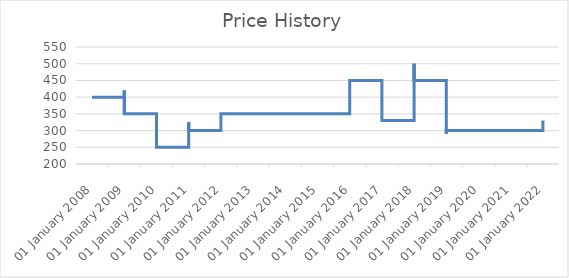
| Category | Series 0 |
|---|---|
| 2008-05-12 | 400 |
| 2008-05-13 | 400 |
| 2008-05-14 | 400 |
| 2008-05-15 | 400 |
| 2008-05-16 | 400 |
| 2008-05-19 | 400 |
| 2008-05-20 | 400 |
| 2008-05-21 | 400 |
| 2008-05-22 | 400 |
| 2008-05-23 | 400 |
| 2008-05-26 | 400 |
| 2008-05-27 | 400 |
| 2008-05-28 | 400 |
| 2008-05-29 | 400 |
| 2008-05-30 | 400 |
| 2008-06-02 | 400 |
| 2008-06-03 | 400 |
| 2008-06-04 | 400 |
| 2008-06-05 | 400 |
| 2008-06-06 | 400 |
| 2008-06-09 | 400 |
| 2008-06-10 | 400 |
| 2008-06-11 | 400 |
| 2008-06-12 | 400 |
| 2008-06-13 | 400 |
| 2008-06-16 | 400 |
| 2008-06-17 | 400 |
| 2008-06-18 | 400 |
| 2008-06-19 | 400 |
| 2008-06-20 | 400 |
| 2008-06-23 | 400 |
| 2008-06-24 | 400 |
| 2008-06-25 | 400 |
| 2008-06-26 | 400 |
| 2008-06-27 | 400 |
| 2008-06-30 | 400 |
| 2008-07-01 | 400 |
| 2008-07-02 | 400 |
| 2008-07-03 | 400 |
| 2008-07-04 | 400 |
| 2008-07-07 | 400 |
| 2008-07-08 | 400 |
| 2008-07-09 | 400 |
| 2008-07-10 | 400 |
| 2008-07-11 | 400 |
| 2008-07-14 | 400 |
| 2008-07-15 | 400 |
| 2008-07-16 | 400 |
| 2008-07-17 | 400 |
| 2008-07-18 | 400 |
| 2008-07-21 | 400 |
| 2008-07-22 | 400 |
| 2008-07-23 | 400 |
| 2008-07-24 | 400 |
| 2008-07-25 | 400 |
| 2008-07-28 | 400 |
| 2008-07-29 | 400 |
| 2008-07-30 | 400 |
| 2008-07-31 | 400 |
| 2008-08-01 | 400 |
| 2008-08-04 | 400 |
| 2008-08-05 | 400 |
| 2008-08-06 | 400 |
| 2008-08-07 | 400 |
| 2008-08-08 | 400 |
| 2008-08-11 | 400 |
| 2008-08-12 | 400 |
| 2008-08-13 | 400 |
| 2008-08-14 | 400 |
| 2008-08-15 | 400 |
| 2008-08-18 | 400 |
| 2008-08-19 | 400 |
| 2008-08-20 | 400 |
| 2008-08-21 | 400 |
| 2008-08-22 | 400 |
| 2008-08-25 | 400 |
| 2008-08-26 | 400 |
| 2008-08-27 | 400 |
| 2008-08-28 | 400 |
| 2008-08-29 | 400 |
| 2008-09-01 | 400 |
| 2008-09-02 | 400 |
| 2008-09-03 | 400 |
| 2008-09-04 | 400 |
| 2008-09-05 | 400 |
| 2008-09-08 | 400 |
| 2008-09-09 | 400 |
| 2008-09-10 | 400 |
| 2008-09-11 | 400 |
| 2008-09-12 | 400 |
| 2008-09-15 | 400 |
| 2008-09-16 | 400 |
| 2008-09-17 | 400 |
| 2008-09-18 | 400 |
| 2008-09-19 | 400 |
| 2008-09-22 | 400 |
| 2008-09-23 | 400 |
| 2008-09-24 | 400 |
| 2008-09-25 | 400 |
| 2008-09-26 | 400 |
| 2008-09-29 | 400 |
| 2008-09-30 | 400 |
| 2008-10-01 | 400 |
| 2008-10-02 | 400 |
| 2008-10-03 | 400 |
| 2008-10-06 | 400 |
| 2008-10-07 | 400 |
| 2008-10-08 | 400 |
| 2008-10-09 | 400 |
| 2008-10-10 | 400 |
| 2008-10-13 | 400 |
| 2008-10-14 | 400 |
| 2008-10-15 | 400 |
| 2008-10-16 | 400 |
| 2008-10-17 | 400 |
| 2008-10-20 | 400 |
| 2008-10-21 | 400 |
| 2008-10-22 | 400 |
| 2008-10-23 | 400 |
| 2008-10-24 | 400 |
| 2008-10-27 | 400 |
| 2008-10-28 | 400 |
| 2008-10-29 | 400 |
| 2008-10-30 | 400 |
| 2008-10-31 | 400 |
| 2008-11-03 | 400 |
| 2008-11-04 | 400 |
| 2008-11-05 | 400 |
| 2008-11-06 | 400 |
| 2008-11-07 | 400 |
| 2008-11-10 | 400 |
| 2008-11-11 | 400 |
| 2008-11-12 | 400 |
| 2008-11-13 | 400 |
| 2008-11-14 | 400 |
| 2008-11-17 | 400 |
| 2008-11-18 | 400 |
| 2008-11-19 | 400 |
| 2008-11-20 | 400 |
| 2008-11-21 | 400 |
| 2008-11-24 | 400 |
| 2008-11-25 | 400 |
| 2008-11-26 | 400 |
| 2008-11-27 | 400 |
| 2008-11-28 | 400 |
| 2008-12-01 | 400 |
| 2008-12-02 | 400 |
| 2008-12-03 | 400 |
| 2008-12-04 | 400 |
| 2008-12-05 | 400 |
| 2008-12-08 | 400 |
| 2008-12-09 | 400 |
| 2008-12-10 | 400 |
| 2008-12-11 | 400 |
| 2008-12-12 | 400 |
| 2008-12-15 | 400 |
| 2008-12-16 | 400 |
| 2008-12-17 | 400 |
| 2008-12-18 | 400 |
| 2008-12-19 | 400 |
| 2008-12-22 | 400 |
| 2008-12-23 | 400 |
| 2008-12-24 | 400 |
| 2008-12-25 | 400 |
| 2008-12-26 | 400 |
| 2008-12-29 | 400 |
| 2008-12-30 | 400 |
| 2008-12-31 | 400 |
| 2009-01-01 | 400 |
| 2009-01-02 | 400 |
| 2009-01-05 | 400 |
| 2009-01-06 | 400 |
| 2009-01-07 | 400 |
| 2009-01-08 | 400 |
| 2009-01-09 | 400 |
| 2009-01-12 | 400 |
| 2009-01-13 | 400 |
| 2009-01-14 | 400 |
| 2009-01-15 | 400 |
| 2009-01-16 | 400 |
| 2009-01-19 | 400 |
| 2009-01-20 | 400 |
| 2009-01-21 | 400 |
| 2009-01-22 | 400 |
| 2009-01-23 | 400 |
| 2009-01-26 | 400 |
| 2009-01-27 | 400 |
| 2009-01-28 | 400 |
| 2009-01-29 | 400 |
| 2009-01-30 | 400 |
| 2009-02-02 | 400 |
| 2009-02-03 | 400 |
| 2009-02-04 | 400 |
| 2009-02-05 | 400 |
| 2009-02-06 | 400 |
| 2009-02-09 | 400 |
| 2009-02-10 | 400 |
| 2009-02-11 | 400 |
| 2009-02-12 | 400 |
| 2009-02-13 | 400 |
| 2009-02-16 | 400 |
| 2009-02-17 | 400 |
| 2009-02-18 | 400 |
| 2009-02-19 | 400 |
| 2009-02-20 | 400 |
| 2009-02-23 | 400 |
| 2009-02-24 | 400 |
| 2009-02-25 | 400 |
| 2009-02-26 | 400 |
| 2009-02-27 | 400 |
| 2009-03-02 | 400 |
| 2009-03-03 | 400 |
| 2009-03-04 | 420 |
| 2009-03-05 | 420 |
| 2009-03-06 | 420 |
| 2009-03-09 | 420 |
| 2009-03-10 | 420 |
| 2009-03-11 | 420 |
| 2009-03-12 | 420 |
| 2009-03-13 | 420 |
| 2009-03-16 | 420 |
| 2009-03-17 | 420 |
| 2009-03-18 | 420 |
| 2009-03-19 | 420 |
| 2009-03-20 | 420 |
| 2009-03-23 | 420 |
| 2009-03-24 | 420 |
| 2009-03-25 | 420 |
| 2009-03-26 | 420 |
| 2009-03-27 | 420 |
| 2009-03-30 | 420 |
| 2009-03-31 | 420 |
| 2009-04-01 | 420 |
| 2009-04-02 | 420 |
| 2009-04-03 | 420 |
| 2009-04-06 | 420 |
| 2009-04-07 | 420 |
| 2009-04-08 | 420 |
| 2009-04-09 | 420 |
| 2009-04-10 | 420 |
| 2009-04-13 | 420 |
| 2009-04-14 | 420 |
| 2009-04-15 | 420 |
| 2009-04-16 | 420 |
| 2009-04-20 | 420 |
| 2009-04-21 | 420 |
| 2009-04-22 | 420 |
| 2009-04-23 | 420 |
| 2009-04-24 | 420 |
| 2009-04-27 | 420 |
| 2009-04-28 | 420 |
| 2009-04-29 | 420 |
| 2009-04-30 | 420 |
| 2009-05-01 | 420 |
| 2009-05-04 | 420 |
| 2009-05-05 | 420 |
| 2009-05-06 | 420 |
| 2009-05-07 | 420 |
| 2009-05-08 | 420 |
| 2009-05-11 | 420 |
| 2009-05-12 | 420 |
| 2009-05-13 | 420 |
| 2009-05-14 | 420 |
| 2009-05-15 | 420 |
| 2009-05-18 | 420 |
| 2009-05-19 | 420 |
| 2009-05-20 | 420 |
| 2009-05-21 | 420 |
| 2009-05-22 | 420 |
| 2009-05-25 | 420 |
| 2009-05-26 | 420 |
| 2009-05-27 | 420 |
| 2009-05-28 | 420 |
| 2009-05-29 | 420 |
| 2009-06-01 | 420 |
| 2009-06-02 | 420 |
| 2009-06-03 | 420 |
| 2009-06-04 | 420 |
| 2009-06-05 | 420 |
| 2009-06-08 | 420 |
| 2009-06-09 | 420 |
| 2009-06-10 | 420 |
| 2009-06-11 | 420 |
| 2009-06-12 | 420 |
| 2009-06-15 | 420 |
| 2009-06-16 | 420 |
| 2009-06-17 | 420 |
| 2009-06-18 | 420 |
| 2009-06-19 | 420 |
| 2009-06-22 | 420 |
| 2009-06-23 | 420 |
| 2009-06-24 | 420 |
| 2009-06-25 | 420 |
| 2009-06-26 | 420 |
| 2009-06-29 | 420 |
| 2009-06-30 | 420 |
| 2009-07-01 | 420 |
| 2009-07-02 | 420 |
| 2009-07-03 | 420 |
| 2009-07-06 | 420 |
| 2009-07-07 | 350 |
| 2009-07-08 | 350 |
| 2009-07-09 | 350 |
| 2009-07-10 | 350 |
| 2009-07-13 | 350 |
| 2009-07-14 | 350 |
| 2009-07-15 | 350 |
| 2009-07-16 | 350 |
| 2009-07-17 | 350 |
| 2009-07-20 | 350 |
| 2009-07-21 | 350 |
| 2009-07-22 | 350 |
| 2009-07-23 | 350 |
| 2009-07-24 | 350 |
| 2009-07-27 | 350 |
| 2009-07-28 | 350 |
| 2009-07-29 | 350 |
| 2009-07-30 | 350 |
| 2009-07-31 | 350 |
| 2009-08-03 | 350 |
| 2009-08-04 | 350 |
| 2009-08-05 | 350 |
| 2009-08-06 | 350 |
| 2009-08-07 | 350 |
| 2009-08-10 | 350 |
| 2009-08-11 | 350 |
| 2009-08-12 | 350 |
| 2009-08-13 | 350 |
| 2009-08-14 | 350 |
| 2009-08-17 | 350 |
| 2009-08-18 | 350 |
| 2009-08-19 | 350 |
| 2009-08-20 | 350 |
| 2009-08-21 | 350 |
| 2009-08-24 | 350 |
| 2009-08-25 | 350 |
| 2009-08-26 | 350 |
| 2009-08-27 | 350 |
| 2009-08-28 | 350 |
| 2009-08-31 | 350 |
| 2009-09-01 | 350 |
| 2009-09-02 | 350 |
| 2009-09-03 | 350 |
| 2009-09-04 | 350 |
| 2009-09-07 | 350 |
| 2009-09-08 | 350 |
| 2009-09-09 | 350 |
| 2009-09-10 | 350 |
| 2009-09-11 | 350 |
| 2009-09-14 | 350 |
| 2009-09-15 | 350 |
| 2009-09-16 | 350 |
| 2009-09-17 | 350 |
| 2009-09-18 | 350 |
| 2009-09-21 | 350 |
| 2009-09-22 | 350 |
| 2009-09-23 | 350 |
| 2009-09-24 | 350 |
| 2009-09-25 | 350 |
| 2009-09-28 | 350 |
| 2009-09-29 | 350 |
| 2009-09-30 | 350 |
| 2009-10-01 | 350 |
| 2009-10-02 | 350 |
| 2009-10-05 | 350 |
| 2009-10-06 | 350 |
| 2009-10-07 | 350 |
| 2009-10-08 | 350 |
| 2009-10-09 | 350 |
| 2009-10-12 | 350 |
| 2009-10-13 | 350 |
| 2009-10-14 | 350 |
| 2009-10-15 | 350 |
| 2009-10-16 | 350 |
| 2009-10-20 | 350 |
| 2009-10-21 | 350 |
| 2009-10-22 | 350 |
| 2009-10-23 | 350 |
| 2009-10-26 | 350 |
| 2009-10-27 | 350 |
| 2009-10-28 | 350 |
| 2009-10-29 | 350 |
| 2009-10-30 | 350 |
| 2009-11-02 | 350 |
| 2009-11-03 | 350 |
| 2009-11-04 | 350 |
| 2009-11-05 | 350 |
| 2009-11-06 | 350 |
| 2009-11-09 | 350 |
| 2009-11-10 | 350 |
| 2009-11-11 | 350 |
| 2009-11-12 | 350 |
| 2009-11-13 | 350 |
| 2009-11-16 | 350 |
| 2009-11-17 | 350 |
| 2009-11-19 | 350 |
| 2009-11-20 | 350 |
| 2009-11-23 | 350 |
| 2009-11-24 | 350 |
| 2009-11-25 | 350 |
| 2009-11-26 | 350 |
| 2009-11-27 | 350 |
| 2009-11-30 | 350 |
| 2009-12-01 | 350 |
| 2009-12-02 | 350 |
| 2009-12-03 | 350 |
| 2009-12-04 | 350 |
| 2009-12-07 | 350 |
| 2009-12-08 | 350 |
| 2009-12-09 | 350 |
| 2009-12-10 | 350 |
| 2009-12-11 | 350 |
| 2009-12-14 | 350 |
| 2009-12-15 | 350 |
| 2009-12-16 | 350 |
| 2009-12-17 | 350 |
| 2009-12-18 | 350 |
| 2009-12-21 | 350 |
| 2009-12-22 | 350 |
| 2009-12-23 | 350 |
| 2009-12-24 | 350 |
| 2009-12-25 | 350 |
| 2009-12-28 | 350 |
| 2009-12-29 | 350 |
| 2009-12-30 | 350 |
| 2009-12-31 | 350 |
| 2010-01-01 | 350 |
| 2010-01-04 | 350 |
| 2010-01-05 | 350 |
| 2010-01-06 | 350 |
| 2010-01-07 | 350 |
| 2010-01-08 | 350 |
| 2010-01-11 | 350 |
| 2010-01-12 | 350 |
| 2010-01-13 | 350 |
| 2010-01-14 | 350 |
| 2010-01-15 | 350 |
| 2010-01-18 | 350 |
| 2010-01-19 | 350 |
| 2010-01-20 | 350 |
| 2010-01-21 | 350 |
| 2010-01-22 | 350 |
| 2010-01-25 | 350 |
| 2010-01-26 | 350 |
| 2010-01-27 | 350 |
| 2010-01-28 | 350 |
| 2010-01-29 | 350 |
| 2010-02-01 | 350 |
| 2010-02-02 | 350 |
| 2010-02-03 | 350 |
| 2010-02-04 | 350 |
| 2010-02-05 | 350 |
| 2010-02-08 | 350 |
| 2010-02-09 | 350 |
| 2010-02-10 | 350 |
| 2010-02-11 | 350 |
| 2010-02-12 | 350 |
| 2010-02-15 | 350 |
| 2010-02-16 | 350 |
| 2010-02-17 | 350 |
| 2010-02-18 | 350 |
| 2010-02-19 | 350 |
| 2010-02-22 | 350 |
| 2010-02-23 | 350 |
| 2010-02-24 | 350 |
| 2010-02-25 | 350 |
| 2010-02-26 | 350 |
| 2010-03-01 | 350 |
| 2010-03-02 | 350 |
| 2010-03-03 | 350 |
| 2010-03-04 | 350 |
| 2010-03-05 | 350 |
| 2010-03-08 | 350 |
| 2010-03-09 | 350 |
| 2010-03-10 | 350 |
| 2010-03-11 | 350 |
| 2010-03-12 | 350 |
| 2010-03-15 | 350 |
| 2010-03-16 | 350 |
| 2010-03-17 | 350 |
| 2010-03-18 | 350 |
| 2010-03-19 | 350 |
| 2010-03-22 | 350 |
| 2010-03-23 | 350 |
| 2010-03-24 | 350 |
| 2010-03-25 | 350 |
| 2010-03-26 | 350 |
| 2010-03-29 | 350 |
| 2010-03-30 | 350 |
| 2010-03-31 | 350 |
| 2010-04-01 | 350 |
| 2010-04-02 | 350 |
| 2010-04-05 | 350 |
| 2010-04-06 | 350 |
| 2010-04-07 | 350 |
| 2010-04-08 | 350 |
| 2010-04-09 | 350 |
| 2010-04-12 | 350 |
| 2010-04-13 | 350 |
| 2010-04-14 | 350 |
| 2010-04-15 | 350 |
| 2010-04-16 | 350 |
| 2010-04-19 | 350 |
| 2010-04-20 | 350 |
| 2010-04-21 | 350 |
| 2010-04-22 | 350 |
| 2010-04-23 | 350 |
| 2010-04-26 | 350 |
| 2010-04-27 | 350 |
| 2010-04-28 | 350 |
| 2010-04-29 | 350 |
| 2010-04-30 | 350 |
| 2010-05-03 | 350 |
| 2010-05-04 | 350 |
| 2010-05-05 | 350 |
| 2010-05-06 | 350 |
| 2010-05-07 | 350 |
| 2010-05-10 | 350 |
| 2010-05-11 | 350 |
| 2010-05-12 | 350 |
| 2010-05-13 | 350 |
| 2010-05-14 | 350 |
| 2010-05-17 | 350 |
| 2010-05-18 | 350 |
| 2010-05-19 | 350 |
| 2010-05-20 | 350 |
| 2010-05-21 | 350 |
| 2010-05-24 | 350 |
| 2010-05-25 | 350 |
| 2010-05-26 | 350 |
| 2010-05-27 | 350 |
| 2010-05-28 | 350 |
| 2010-05-31 | 350 |
| 2010-06-01 | 350 |
| 2010-06-02 | 350 |
| 2010-06-03 | 350 |
| 2010-06-04 | 350 |
| 2010-06-07 | 350 |
| 2010-06-08 | 350 |
| 2010-06-09 | 350 |
| 2010-06-10 | 350 |
| 2010-06-11 | 250 |
| 2010-06-14 | 250 |
| 2010-06-15 | 250 |
| 2010-06-16 | 250 |
| 2010-06-17 | 250 |
| 2010-06-18 | 250 |
| 2010-06-21 | 250 |
| 2010-06-22 | 250 |
| 2010-06-23 | 250 |
| 2010-06-24 | 250 |
| 2010-06-25 | 250 |
| 2010-06-28 | 250 |
| 2010-06-29 | 250 |
| 2010-06-30 | 250 |
| 2010-07-01 | 250 |
| 2010-07-02 | 250 |
| 2010-07-05 | 250 |
| 2010-07-06 | 250 |
| 2010-07-07 | 250 |
| 2010-07-08 | 250 |
| 2010-07-09 | 250 |
| 2010-07-12 | 250 |
| 2010-07-13 | 250 |
| 2010-07-14 | 250 |
| 2010-07-15 | 250 |
| 2010-07-16 | 250 |
| 2010-07-19 | 250 |
| 2010-07-20 | 250 |
| 2010-07-21 | 250 |
| 2010-07-22 | 250 |
| 2010-07-23 | 250 |
| 2010-07-26 | 250 |
| 2010-07-27 | 250 |
| 2010-07-28 | 250 |
| 2010-07-29 | 250 |
| 2010-07-30 | 250 |
| 2010-08-02 | 250 |
| 2010-08-03 | 250 |
| 2010-08-04 | 250 |
| 2010-08-05 | 250 |
| 2010-08-06 | 250 |
| 2010-08-09 | 250 |
| 2010-08-10 | 250 |
| 2010-08-11 | 250 |
| 2010-08-12 | 250 |
| 2010-08-13 | 250 |
| 2010-08-16 | 250 |
| 2010-08-17 | 250 |
| 2010-08-18 | 250 |
| 2010-08-19 | 250 |
| 2010-08-20 | 250 |
| 2010-08-23 | 250 |
| 2010-08-24 | 250 |
| 2010-08-25 | 250 |
| 2010-08-26 | 250 |
| 2010-08-27 | 250 |
| 2010-08-30 | 250 |
| 2010-08-31 | 250 |
| 2010-09-01 | 250 |
| 2010-09-02 | 250 |
| 2010-09-03 | 250 |
| 2010-09-06 | 250 |
| 2010-09-07 | 250 |
| 2010-09-08 | 250 |
| 2010-09-09 | 250 |
| 2010-09-10 | 250 |
| 2010-09-13 | 250 |
| 2010-09-14 | 250 |
| 2010-09-15 | 250 |
| 2010-09-16 | 250 |
| 2010-09-17 | 250 |
| 2010-09-20 | 250 |
| 2010-09-21 | 250 |
| 2010-09-22 | 250 |
| 2010-09-23 | 250 |
| 2010-09-24 | 250 |
| 2010-09-27 | 250 |
| 2010-09-28 | 250 |
| 2010-09-29 | 250 |
| 2010-09-30 | 250 |
| 2010-10-01 | 250 |
| 2010-10-04 | 250 |
| 2010-10-05 | 250 |
| 2010-10-06 | 250 |
| 2010-10-07 | 250 |
| 2010-10-08 | 250 |
| 2010-10-11 | 250 |
| 2010-10-12 | 250 |
| 2010-10-13 | 250 |
| 2010-10-14 | 250 |
| 2010-10-15 | 250 |
| 2010-10-18 | 250 |
| 2010-10-19 | 250 |
| 2010-10-20 | 250 |
| 2010-10-21 | 250 |
| 2010-10-22 | 250 |
| 2010-10-25 | 250 |
| 2010-10-26 | 250 |
| 2010-10-27 | 250 |
| 2010-10-28 | 250 |
| 2010-10-29 | 250 |
| 2010-11-01 | 250 |
| 2010-11-02 | 250 |
| 2010-11-03 | 250 |
| 2010-11-04 | 250 |
| 2010-11-05 | 250 |
| 2010-11-08 | 250 |
| 2010-11-09 | 250 |
| 2010-11-10 | 250 |
| 2010-11-11 | 250 |
| 2010-11-12 | 250 |
| 2010-11-15 | 250 |
| 2010-11-16 | 250 |
| 2010-11-17 | 250 |
| 2010-11-18 | 250 |
| 2010-11-19 | 250 |
| 2010-11-22 | 250 |
| 2010-11-23 | 250 |
| 2010-11-24 | 250 |
| 2010-11-25 | 250 |
| 2010-11-26 | 250 |
| 2010-11-29 | 250 |
| 2010-11-30 | 250 |
| 2010-12-01 | 250 |
| 2010-12-02 | 250 |
| 2010-12-03 | 250 |
| 2010-12-06 | 250 |
| 2010-12-07 | 250 |
| 2010-12-08 | 250 |
| 2010-12-09 | 250 |
| 2010-12-10 | 250 |
| 2010-12-13 | 250 |
| 2010-12-14 | 250 |
| 2010-12-15 | 250 |
| 2010-12-16 | 250 |
| 2010-12-17 | 250 |
| 2010-12-20 | 250 |
| 2010-12-21 | 250 |
| 2010-12-22 | 250 |
| 2010-12-23 | 250 |
| 2010-12-24 | 250 |
| 2010-12-27 | 250 |
| 2010-12-28 | 250 |
| 2010-12-29 | 250 |
| 2010-12-30 | 250 |
| 2010-12-31 | 250 |
| 2011-01-03 | 250 |
| 2011-01-04 | 250 |
| 2011-01-05 | 325 |
| 2011-01-06 | 325 |
| 2011-01-07 | 325 |
| 2011-01-10 | 325 |
| 2011-01-11 | 325 |
| 2011-01-12 | 325 |
| 2011-01-13 | 325 |
| 2011-01-14 | 325 |
| 2011-01-17 | 325 |
| 2011-01-18 | 325 |
| 2011-01-19 | 325 |
| 2011-01-20 | 325 |
| 2011-01-21 | 325 |
| 2011-01-24 | 325 |
| 2011-01-25 | 325 |
| 2011-01-26 | 325 |
| 2011-01-27 | 325 |
| 2011-01-28 | 325 |
| 2011-01-31 | 325 |
| 2011-02-01 | 325 |
| 2011-02-02 | 325 |
| 2011-02-03 | 325 |
| 2011-02-04 | 325 |
| 2011-02-07 | 325 |
| 2011-02-08 | 325 |
| 2011-02-09 | 325 |
| 2011-02-16 | 325 |
| 2011-02-17 | 325 |
| 2011-02-18 | 325 |
| 2011-02-21 | 325 |
| 2011-02-22 | 325 |
| 2011-02-23 | 325 |
| 2011-02-24 | 325 |
| 2011-02-25 | 325 |
| 2011-02-28 | 325 |
| 2011-03-01 | 325 |
| 2011-03-02 | 325 |
| 2011-03-03 | 325 |
| 2011-03-04 | 325 |
| 2011-03-07 | 325 |
| 2011-03-08 | 325 |
| 2011-03-09 | 325 |
| 2011-03-10 | 325 |
| 2011-03-11 | 325 |
| 2011-03-14 | 325 |
| 2011-03-15 | 325 |
| 2011-03-16 | 325 |
| 2011-03-17 | 325 |
| 2011-03-18 | 325 |
| 2011-03-21 | 325 |
| 2011-03-22 | 325 |
| 2011-03-23 | 325 |
| 2011-03-24 | 325 |
| 2011-03-25 | 325 |
| 2011-03-28 | 325 |
| 2011-03-29 | 325 |
| 2011-03-30 | 325 |
| 2011-03-31 | 325 |
| 2011-04-01 | 325 |
| 2011-04-04 | 325 |
| 2011-04-05 | 325 |
| 2011-04-06 | 325 |
| 2011-04-07 | 325 |
| 2011-04-08 | 325 |
| 2011-04-11 | 325 |
| 2011-04-12 | 325 |
| 2011-04-13 | 325 |
| 2011-04-14 | 325 |
| 2011-04-15 | 325 |
| 2011-04-18 | 325 |
| 2011-04-19 | 325 |
| 2011-04-20 | 325 |
| 2011-04-21 | 325 |
| 2011-04-22 | 325 |
| 2011-04-25 | 325 |
| 2011-04-26 | 325 |
| 2011-04-27 | 325 |
| 2011-04-28 | 325 |
| 2011-04-29 | 325 |
| 2011-05-02 | 325 |
| 2011-05-03 | 325 |
| 2011-05-04 | 325 |
| 2011-05-05 | 325 |
| 2011-05-06 | 325 |
| 2011-05-09 | 325 |
| 2011-05-10 | 325 |
| 2011-05-11 | 325 |
| 2011-05-12 | 325 |
| 2011-05-13 | 325 |
| 2011-05-23 | 325 |
| 2011-05-24 | 325 |
| 2011-05-25 | 325 |
| 2011-05-26 | 325 |
| 2011-05-27 | 325 |
| 2011-05-30 | 325 |
| 2011-05-31 | 325 |
| 2011-06-01 | 325 |
| 2011-06-02 | 325 |
| 2011-06-03 | 325 |
| 2011-06-06 | 325 |
| 2011-06-07 | 325 |
| 2011-06-08 | 325 |
| 2011-06-09 | 325 |
| 2011-06-10 | 325 |
| 2011-06-13 | 325 |
| 2011-06-14 | 325 |
| 2011-06-15 | 325 |
| 2011-06-16 | 325 |
| 2011-06-17 | 325 |
| 2011-06-20 | 325 |
| 2011-06-21 | 325 |
| 2011-06-22 | 325 |
| 2011-06-23 | 325 |
| 2011-06-24 | 325 |
| 2011-06-27 | 325 |
| 2011-06-28 | 325 |
| 2011-06-29 | 325 |
| 2011-06-30 | 300 |
| 2011-07-01 | 300 |
| 2011-07-04 | 300 |
| 2011-07-05 | 300 |
| 2011-07-06 | 300 |
| 2011-07-07 | 300 |
| 2011-07-08 | 300 |
| 2011-07-11 | 300 |
| 2011-07-12 | 300 |
| 2011-07-13 | 300 |
| 2011-07-14 | 300 |
| 2011-07-15 | 300 |
| 2011-07-18 | 300 |
| 2011-07-19 | 300 |
| 2011-07-20 | 300 |
| 2011-07-21 | 300 |
| 2011-07-22 | 300 |
| 2011-07-25 | 300 |
| 2011-07-26 | 300 |
| 2011-07-27 | 300 |
| 2011-07-28 | 300 |
| 2011-07-29 | 300 |
| 2011-08-01 | 300 |
| 2011-08-02 | 300 |
| 2011-08-03 | 300 |
| 2011-08-04 | 300 |
| 2011-08-05 | 300 |
| 2011-08-08 | 300 |
| 2011-08-09 | 300 |
| 2011-08-10 | 300 |
| 2011-08-11 | 300 |
| 2011-08-12 | 300 |
| 2011-08-15 | 300 |
| 2011-08-16 | 300 |
| 2011-08-17 | 300 |
| 2011-08-18 | 300 |
| 2011-08-19 | 300 |
| 2011-08-22 | 300 |
| 2011-08-23 | 300 |
| 2011-08-24 | 300 |
| 2011-08-25 | 300 |
| 2011-08-26 | 300 |
| 2011-08-29 | 300 |
| 2011-08-30 | 300 |
| 2011-08-31 | 300 |
| 2011-09-01 | 300 |
| 2011-09-02 | 300 |
| 2011-09-05 | 300 |
| 2011-09-06 | 300 |
| 2011-09-07 | 300 |
| 2011-09-08 | 300 |
| 2011-09-09 | 300 |
| 2011-09-12 | 300 |
| 2011-09-13 | 300 |
| 2011-09-14 | 300 |
| 2011-09-15 | 300 |
| 2011-09-16 | 300 |
| 2011-09-26 | 300 |
| 2011-09-27 | 300 |
| 2011-09-28 | 300 |
| 2011-09-29 | 300 |
| 2011-09-30 | 300 |
| 2011-10-03 | 300 |
| 2011-10-04 | 300 |
| 2011-10-05 | 300 |
| 2011-10-06 | 300 |
| 2011-10-07 | 300 |
| 2011-10-10 | 300 |
| 2011-10-11 | 300 |
| 2011-10-12 | 300 |
| 2011-10-13 | 300 |
| 2011-10-14 | 300 |
| 2011-10-17 | 300 |
| 2011-10-18 | 300 |
| 2011-10-19 | 300 |
| 2011-10-20 | 300 |
| 2011-10-21 | 300 |
| 2011-10-24 | 300 |
| 2011-10-25 | 300 |
| 2011-10-26 | 300 |
| 2011-10-27 | 300 |
| 2011-10-28 | 300 |
| 2011-10-31 | 300 |
| 2011-11-01 | 300 |
| 2011-11-02 | 300 |
| 2011-11-03 | 300 |
| 2011-11-04 | 300 |
| 2011-11-07 | 300 |
| 2011-11-08 | 300 |
| 2011-11-09 | 300 |
| 2011-11-10 | 300 |
| 2011-11-11 | 300 |
| 2011-11-14 | 300 |
| 2011-11-15 | 300 |
| 2011-11-16 | 300 |
| 2011-11-17 | 300 |
| 2011-11-18 | 300 |
| 2011-11-21 | 300 |
| 2011-11-22 | 300 |
| 2011-11-23 | 300 |
| 2011-11-24 | 300 |
| 2011-11-25 | 300 |
| 2011-11-28 | 300 |
| 2011-11-29 | 300 |
| 2011-11-30 | 300 |
| 2011-12-01 | 300 |
| 2011-12-02 | 300 |
| 2011-12-05 | 300 |
| 2011-12-06 | 300 |
| 2011-12-07 | 300 |
| 2011-12-08 | 300 |
| 2011-12-09 | 300 |
| 2011-12-12 | 300 |
| 2011-12-13 | 300 |
| 2011-12-14 | 300 |
| 2011-12-15 | 300 |
| 2011-12-16 | 300 |
| 2011-12-19 | 300 |
| 2011-12-20 | 300 |
| 2011-12-21 | 300 |
| 2011-12-22 | 300 |
| 2011-12-23 | 300 |
| 2011-12-26 | 300 |
| 2011-12-27 | 300 |
| 2011-12-28 | 300 |
| 2011-12-29 | 300 |
| 2011-12-30 | 300 |
| 2012-01-02 | 300 |
| 2012-01-03 | 300 |
| 2012-01-04 | 300 |
| 2012-01-05 | 300 |
| 2012-01-06 | 300 |
| 2012-01-09 | 300 |
| 2012-01-10 | 300 |
| 2012-01-11 | 300 |
| 2012-01-12 | 300 |
| 2012-01-13 | 300 |
| 2012-01-16 | 300 |
| 2012-01-17 | 300 |
| 2012-01-18 | 300 |
| 2012-01-19 | 300 |
| 2012-01-20 | 300 |
| 2012-01-23 | 300 |
| 2012-01-24 | 300 |
| 2012-01-25 | 300 |
| 2012-01-26 | 300 |
| 2012-01-27 | 300 |
| 2012-01-30 | 300 |
| 2012-01-31 | 300 |
| 2012-02-01 | 300 |
| 2012-02-02 | 300 |
| 2012-02-03 | 300 |
| 2012-02-06 | 300 |
| 2012-02-07 | 300 |
| 2012-02-08 | 300 |
| 2012-02-09 | 300 |
| 2012-02-10 | 300 |
| 2012-02-13 | 300 |
| 2012-02-14 | 300 |
| 2012-02-15 | 300 |
| 2012-02-16 | 300 |
| 2012-02-17 | 300 |
| 2012-02-20 | 300 |
| 2012-02-21 | 300 |
| 2012-02-22 | 300 |
| 2012-02-23 | 300 |
| 2012-02-24 | 300 |
| 2012-02-27 | 300 |
| 2012-02-28 | 300 |
| 2012-02-29 | 300 |
| 2012-03-01 | 300 |
| 2012-03-02 | 300 |
| 2012-03-05 | 300 |
| 2012-03-06 | 300 |
| 2012-03-07 | 300 |
| 2012-03-08 | 300 |
| 2012-03-09 | 300 |
| 2012-03-12 | 300 |
| 2012-03-13 | 300 |
| 2012-03-14 | 300 |
| 2012-03-15 | 300 |
| 2012-03-16 | 300 |
| 2012-03-19 | 300 |
| 2012-03-20 | 300 |
| 2012-03-21 | 300 |
| 2012-03-22 | 300 |
| 2012-03-23 | 300 |
| 2012-04-05 | 300 |
| 2012-04-06 | 300 |
| 2012-04-09 | 300 |
| 2012-04-10 | 300 |
| 2012-04-11 | 300 |
| 2012-04-12 | 300 |
| 2012-04-13 | 300 |
| 2012-04-16 | 300 |
| 2012-04-17 | 300 |
| 2012-04-18 | 300 |
| 2012-04-19 | 300 |
| 2012-04-20 | 300 |
| 2012-04-23 | 300 |
| 2012-04-24 | 300 |
| 2012-04-25 | 300 |
| 2012-04-26 | 300 |
| 2012-04-27 | 300 |
| 2012-04-30 | 300 |
| 2012-05-01 | 300 |
| 2012-05-02 | 300 |
| 2012-05-03 | 300 |
| 2012-05-04 | 300 |
| 2012-05-07 | 300 |
| 2012-05-08 | 300 |
| 2012-05-09 | 300 |
| 2012-05-10 | 300 |
| 2012-05-11 | 300 |
| 2012-05-14 | 300 |
| 2012-05-15 | 300 |
| 2012-05-16 | 300 |
| 2012-05-17 | 300 |
| 2012-05-18 | 300 |
| 2012-05-21 | 300 |
| 2012-05-22 | 300 |
| 2012-05-23 | 300 |
| 2012-05-24 | 300 |
| 2012-05-25 | 300 |
| 2012-05-28 | 300 |
| 2012-05-29 | 300 |
| 2012-05-30 | 300 |
| 2012-05-31 | 300 |
| 2012-06-01 | 300 |
| 2012-06-04 | 300 |
| 2012-06-05 | 300 |
| 2012-06-06 | 300 |
| 2012-06-07 | 300 |
| 2012-06-08 | 300 |
| 2012-06-11 | 300 |
| 2012-06-12 | 300 |
| 2012-06-13 | 300 |
| 2012-06-14 | 300 |
| 2012-06-15 | 300 |
| 2012-06-18 | 300 |
| 2012-06-19 | 300 |
| 2012-06-20 | 300 |
| 2012-06-21 | 300 |
| 2012-06-22 | 300 |
| 2012-06-25 | 300 |
| 2012-06-26 | 300 |
| 2012-06-27 | 300 |
| 2012-06-28 | 300 |
| 2012-06-29 | 300 |
| 2012-07-02 | 300 |
| 2012-07-03 | 300 |
| 2012-07-04 | 300 |
| 2012-07-05 | 300 |
| 2012-07-06 | 300 |
| 2012-07-09 | 300 |
| 2012-07-10 | 300 |
| 2012-07-11 | 300 |
| 2012-07-12 | 300 |
| 2012-07-13 | 300 |
| 2012-07-16 | 300 |
| 2012-07-17 | 300 |
| 2012-07-18 | 300 |
| 2012-07-19 | 300 |
| 2012-07-20 | 300 |
| 2012-07-23 | 300 |
| 2012-07-24 | 300 |
| 2012-07-25 | 300 |
| 2012-07-26 | 300 |
| 2012-07-27 | 300 |
| 2012-07-30 | 300 |
| 2012-07-31 | 300 |
| 2012-08-01 | 300 |
| 2012-08-02 | 300 |
| 2012-08-03 | 300 |
| 2012-08-06 | 300 |
| 2012-08-07 | 300 |
| 2012-08-08 | 300 |
| 2012-08-09 | 300 |
| 2012-08-10 | 300 |
| 2012-08-13 | 300 |
| 2012-08-14 | 300 |
| 2012-08-15 | 300 |
| 2012-08-16 | 300 |
| 2012-08-17 | 300 |
| 2012-08-20 | 300 |
| 2012-08-21 | 300 |
| 2012-08-22 | 300 |
| 2012-08-23 | 300 |
| 2012-08-24 | 300 |
| 2012-08-27 | 300 |
| 2012-08-28 | 300 |
| 2012-08-29 | 300 |
| 2012-08-30 | 300 |
| 2012-08-31 | 300 |
| 2012-09-03 | 300 |
| 2012-09-04 | 300 |
| 2012-09-05 | 300 |
| 2012-09-06 | 300 |
| 2012-09-07 | 300 |
| 2012-09-10 | 300 |
| 2012-09-11 | 300 |
| 2012-09-12 | 300 |
| 2012-09-13 | 300 |
| 2012-09-14 | 300 |
| 2012-09-17 | 300 |
| 2012-09-18 | 300 |
| 2012-09-19 | 300 |
| 2012-09-20 | 300 |
| 2012-09-21 | 300 |
| 2012-09-24 | 300 |
| 2012-09-25 | 300 |
| 2012-09-26 | 300 |
| 2012-09-27 | 300 |
| 2012-09-28 | 300 |
| 2012-10-01 | 300 |
| 2012-10-02 | 300 |
| 2012-10-03 | 300 |
| 2012-10-04 | 300 |
| 2012-10-05 | 300 |
| 2012-10-08 | 300 |
| 2012-10-09 | 300 |
| 2012-10-10 | 300 |
| 2012-10-11 | 300 |
| 2012-10-12 | 300 |
| 2012-10-15 | 300 |
| 2012-10-16 | 300 |
| 2012-10-17 | 300 |
| 2012-10-18 | 300 |
| 2012-10-19 | 300 |
| 2012-10-22 | 300 |
| 2012-10-23 | 300 |
| 2012-10-24 | 300 |
| 2012-10-25 | 300 |
| 2012-10-26 | 300 |
| 2012-10-29 | 300 |
| 2012-10-30 | 300 |
| 2012-10-31 | 300 |
| 2012-11-01 | 300 |
| 2012-11-02 | 300 |
| 2012-11-05 | 300 |
| 2012-11-06 | 300 |
| 2012-11-07 | 300 |
| 2012-11-08 | 300 |
| 2012-11-09 | 300 |
| 2012-11-12 | 300 |
| 2012-11-13 | 300 |
| 2012-11-14 | 300 |
| 2012-11-15 | 300 |
| 2012-11-16 | 300 |
| 2012-11-19 | 300 |
| 2012-11-20 | 300 |
| 2012-11-21 | 300 |
| 2012-11-22 | 300 |
| 2012-11-23 | 300 |
| 2012-11-26 | 300 |
| 2012-11-27 | 300 |
| 2012-11-28 | 300 |
| 2012-11-29 | 300 |
| 2012-11-30 | 300 |
| 2012-12-03 | 300 |
| 2012-12-04 | 300 |
| 2012-12-05 | 350 |
| 2012-12-06 | 350 |
| 2012-12-07 | 350 |
| 2012-12-10 | 350 |
| 2012-12-11 | 350 |
| 2012-12-12 | 350 |
| 2012-12-17 | 350 |
| 2012-12-18 | 350 |
| 2012-12-19 | 350 |
| 2012-12-20 | 350 |
| 2012-12-21 | 350 |
| 2012-12-25 | 350 |
| 2012-12-26 | 350 |
| 2012-12-27 | 350 |
| 2012-12-31 | 350 |
| 2013-01-01 | 350 |
| 2013-01-02 | 350 |
| 2013-01-03 | 350 |
| 2013-01-04 | 350 |
| 2013-01-07 | 350 |
| 2013-01-08 | 350 |
| 2013-01-09 | 350 |
| 2013-01-10 | 350 |
| 2013-01-11 | 350 |
| 2013-01-14 | 350 |
| 2013-01-15 | 350 |
| 2013-01-16 | 350 |
| 2013-01-17 | 350 |
| 2013-01-18 | 350 |
| 2013-01-21 | 350 |
| 2013-01-22 | 350 |
| 2013-01-23 | 350 |
| 2013-01-24 | 350 |
| 2013-01-28 | 350 |
| 2013-01-29 | 350 |
| 2013-01-30 | 350 |
| 2013-01-31 | 350 |
| 2013-02-11 | 350 |
| 2013-02-12 | 350 |
| 2013-02-13 | 350 |
| 2013-02-14 | 350 |
| 2013-02-15 | 350 |
| 2013-02-18 | 350 |
| 2013-02-19 | 350 |
| 2013-02-20 | 350 |
| 2013-02-21 | 350 |
| 2013-02-22 | 350 |
| 2013-02-25 | 350 |
| 2013-02-26 | 350 |
| 2013-02-27 | 350 |
| 2013-03-04 | 350 |
| 2013-03-05 | 350 |
| 2013-03-06 | 350 |
| 2013-03-07 | 350 |
| 2013-03-08 | 350 |
| 2013-03-11 | 350 |
| 2013-03-12 | 350 |
| 2013-03-13 | 350 |
| 2013-03-14 | 350 |
| 2013-03-15 | 350 |
| 2013-03-18 | 350 |
| 2013-03-19 | 350 |
| 2013-03-20 | 350 |
| 2013-03-21 | 350 |
| 2013-03-22 | 350 |
| 2013-03-25 | 350 |
| 2013-03-26 | 350 |
| 2013-03-27 | 350 |
| 2013-03-28 | 350 |
| 2013-03-29 | 350 |
| 2013-04-01 | 350 |
| 2013-04-02 | 350 |
| 2013-04-03 | 350 |
| 2013-04-04 | 350 |
| 2013-04-05 | 350 |
| 2013-04-09 | 350 |
| 2013-04-10 | 350 |
| 2013-04-11 | 350 |
| 2013-04-12 | 350 |
| 2013-04-15 | 350 |
| 2013-04-16 | 350 |
| 2013-04-17 | 350 |
| 2013-04-18 | 350 |
| 2013-04-19 | 350 |
| 2013-04-22 | 350 |
| 2013-04-23 | 350 |
| 2013-04-24 | 350 |
| 2013-04-25 | 350 |
| 2013-04-26 | 350 |
| 2013-04-29 | 350 |
| 2013-04-30 | 350 |
| 2013-05-01 | 350 |
| 2013-05-02 | 350 |
| 2013-05-03 | 350 |
| 2013-05-06 | 350 |
| 2013-05-07 | 350 |
| 2013-05-08 | 350 |
| 2013-05-09 | 350 |
| 2013-05-10 | 350 |
| 2013-05-13 | 350 |
| 2013-05-14 | 350 |
| 2013-05-15 | 350 |
| 2013-05-16 | 350 |
| 2013-05-17 | 350 |
| 2013-05-20 | 350 |
| 2013-05-21 | 350 |
| 2013-05-22 | 350 |
| 2013-05-23 | 350 |
| 2013-05-27 | 350 |
| 2013-05-28 | 350 |
| 2013-05-29 | 350 |
| 2013-05-30 | 350 |
| 2013-05-31 | 350 |
| 2013-06-05 | 350 |
| 2013-06-06 | 350 |
| 2013-06-07 | 350 |
| 2013-06-10 | 350 |
| 2013-06-11 | 350 |
| 2013-06-12 | 350 |
| 2013-06-13 | 350 |
| 2013-06-14 | 350 |
| 2013-06-19 | 350 |
| 2013-06-20 | 350 |
| 2013-06-21 | 350 |
| 2013-06-24 | 350 |
| 2013-06-25 | 350 |
| 2013-06-26 | 350 |
| 2013-06-27 | 350 |
| 2013-06-28 | 350 |
| 2013-07-01 | 350 |
| 2013-07-02 | 350 |
| 2013-07-03 | 350 |
| 2013-07-04 | 350 |
| 2013-07-05 | 350 |
| 2013-07-08 | 350 |
| 2013-07-09 | 350 |
| 2013-07-10 | 350 |
| 2013-07-11 | 350 |
| 2013-07-12 | 350 |
| 2013-07-15 | 350 |
| 2013-07-16 | 350 |
| 2013-07-19 | 350 |
| 2013-07-26 | 350 |
| 2013-07-29 | 350 |
| 2013-07-30 | 350 |
| 2013-07-31 | 350 |
| 2013-08-01 | 350 |
| 2013-08-02 | 350 |
| 2013-08-05 | 350 |
| 2013-08-06 | 350 |
| 2013-08-07 | 350 |
| 2013-08-08 | 350 |
| 2013-08-09 | 350 |
| 2013-08-12 | 350 |
| 2013-08-13 | 350 |
| 2013-08-14 | 350 |
| 2013-08-15 | 350 |
| 2013-08-16 | 350 |
| 2013-08-19 | 350 |
| 2013-08-20 | 350 |
| 2013-08-21 | 350 |
| 2013-08-22 | 350 |
| 2013-08-23 | 350 |
| 2013-08-26 | 350 |
| 2013-08-27 | 350 |
| 2013-08-28 | 350 |
| 2013-08-29 | 350 |
| 2013-08-30 | 350 |
| 2013-09-02 | 350 |
| 2013-09-03 | 350 |
| 2013-09-04 | 350 |
| 2013-09-05 | 350 |
| 2013-09-06 | 350 |
| 2013-09-09 | 350 |
| 2013-09-10 | 350 |
| 2013-09-11 | 350 |
| 2013-09-12 | 350 |
| 2013-09-13 | 350 |
| 2013-09-16 | 350 |
| 2013-09-17 | 350 |
| 2013-09-18 | 350 |
| 2013-09-19 | 350 |
| 2013-09-20 | 350 |
| 2013-09-23 | 350 |
| 2013-09-24 | 350 |
| 2013-09-25 | 350 |
| 2013-09-26 | 350 |
| 2013-09-27 | 350 |
| 2013-09-30 | 350 |
| 2013-10-01 | 350 |
| 2013-10-02 | 350 |
| 2013-10-03 | 350 |
| 2013-10-04 | 350 |
| 2013-10-07 | 350 |
| 2013-10-08 | 350 |
| 2013-10-09 | 350 |
| 2013-10-10 | 350 |
| 2013-10-11 | 350 |
| 2013-10-14 | 350 |
| 2013-10-15 | 350 |
| 2013-10-16 | 350 |
| 2013-10-17 | 350 |
| 2013-10-18 | 350 |
| 2013-10-21 | 350 |
| 2013-10-22 | 350 |
| 2013-10-23 | 350 |
| 2013-10-24 | 350 |
| 2013-10-25 | 350 |
| 2013-10-28 | 350 |
| 2013-10-29 | 350 |
| 2013-10-30 | 350 |
| 2013-10-31 | 350 |
| 2013-11-01 | 350 |
| 2013-11-04 | 350 |
| 2013-11-05 | 350 |
| 2013-11-06 | 350 |
| 2013-11-07 | 350 |
| 2013-11-08 | 350 |
| 2013-11-11 | 350 |
| 2013-11-12 | 350 |
| 2013-11-13 | 350 |
| 2013-11-14 | 350 |
| 2013-11-15 | 350 |
| 2013-11-18 | 350 |
| 2013-11-19 | 350 |
| 2013-11-20 | 350 |
| 2013-11-21 | 350 |
| 2013-11-22 | 350 |
| 2013-11-25 | 350 |
| 2013-11-26 | 350 |
| 2013-11-27 | 350 |
| 2013-11-28 | 350 |
| 2013-11-29 | 350 |
| 2013-12-02 | 350 |
| 2013-12-03 | 350 |
| 2013-12-04 | 350 |
| 2013-12-05 | 350 |
| 2013-12-06 | 350 |
| 2013-12-09 | 350 |
| 2013-12-10 | 350 |
| 2013-12-11 | 350 |
| 2013-12-12 | 350 |
| 2013-12-13 | 350 |
| 2013-12-16 | 350 |
| 2013-12-17 | 350 |
| 2013-12-18 | 350 |
| 2013-12-19 | 350 |
| 2013-12-20 | 350 |
| 2013-12-23 | 350 |
| 2013-12-24 | 350 |
| 2013-12-25 | 350 |
| 2013-12-26 | 350 |
| 2013-12-27 | 350 |
| 2013-12-30 | 350 |
| 2013-12-31 | 350 |
| 2014-01-01 | 350 |
| 2014-01-02 | 350 |
| 2014-01-03 | 350 |
| 2014-01-06 | 350 |
| 2014-01-07 | 350 |
| 2014-01-08 | 350 |
| 2014-01-09 | 350 |
| 2014-01-10 | 350 |
| 2014-01-13 | 350 |
| 2014-01-14 | 350 |
| 2014-01-15 | 350 |
| 2014-01-16 | 350 |
| 2014-01-17 | 350 |
| 2014-01-20 | 350 |
| 2014-01-21 | 350 |
| 2014-01-22 | 350 |
| 2014-01-23 | 350 |
| 2014-01-24 | 350 |
| 2014-01-27 | 350 |
| 2014-01-28 | 350 |
| 2014-01-29 | 350 |
| 2014-01-30 | 350 |
| 2014-01-31 | 350 |
| 2014-02-03 | 350 |
| 2014-02-04 | 350 |
| 2014-02-05 | 350 |
| 2014-02-06 | 350 |
| 2014-02-07 | 350 |
| 2014-02-10 | 350 |
| 2014-02-11 | 350 |
| 2014-02-12 | 350 |
| 2014-02-18 | 350 |
| 2014-02-19 | 350 |
| 2014-02-20 | 350 |
| 2014-02-21 | 350 |
| 2014-02-24 | 350 |
| 2014-02-25 | 350 |
| 2014-02-26 | 350 |
| 2014-02-27 | 350 |
| 2014-02-28 | 350 |
| 2014-03-03 | 350 |
| 2014-03-04 | 350 |
| 2014-03-05 | 350 |
| 2014-03-06 | 350 |
| 2014-03-07 | 350 |
| 2014-03-10 | 350 |
| 2014-03-11 | 350 |
| 2014-03-12 | 350 |
| 2014-03-13 | 350 |
| 2014-03-14 | 350 |
| 2014-03-17 | 350 |
| 2014-03-18 | 350 |
| 2014-03-19 | 350 |
| 2014-03-20 | 350 |
| 2014-03-21 | 350 |
| 2014-03-24 | 350 |
| 2014-03-25 | 350 |
| 2014-03-26 | 350 |
| 2014-03-27 | 350 |
| 2014-03-28 | 350 |
| 2014-03-31 | 350 |
| 2014-04-01 | 350 |
| 2014-04-02 | 350 |
| 2014-04-03 | 350 |
| 2014-04-04 | 350 |
| 2014-04-07 | 350 |
| 2014-04-08 | 350 |
| 2014-04-09 | 350 |
| 2014-04-10 | 350 |
| 2014-04-11 | 350 |
| 2014-04-14 | 350 |
| 2014-04-15 | 350 |
| 2014-04-17 | 350 |
| 2014-04-18 | 350 |
| 2014-04-21 | 350 |
| 2014-04-22 | 350 |
| 2014-04-23 | 350 |
| 2014-04-24 | 350 |
| 2014-04-25 | 350 |
| 2014-04-28 | 350 |
| 2014-04-29 | 350 |
| 2014-04-30 | 350 |
| 2014-05-01 | 350 |
| 2014-05-02 | 350 |
| 2014-05-05 | 350 |
| 2014-05-06 | 350 |
| 2014-05-07 | 350 |
| 2014-05-08 | 350 |
| 2014-05-09 | 350 |
| 2014-05-12 | 350 |
| 2014-05-13 | 350 |
| 2014-05-14 | 350 |
| 2014-05-15 | 350 |
| 2014-05-16 | 350 |
| 2014-05-19 | 350 |
| 2014-05-20 | 350 |
| 2014-05-21 | 350 |
| 2014-05-22 | 350 |
| 2014-05-23 | 350 |
| 2014-05-26 | 350 |
| 2014-05-27 | 350 |
| 2014-05-28 | 350 |
| 2014-05-29 | 350 |
| 2014-05-30 | 350 |
| 2014-06-02 | 350 |
| 2014-06-03 | 350 |
| 2014-06-04 | 350 |
| 2014-06-05 | 350 |
| 2014-06-06 | 350 |
| 2014-06-09 | 350 |
| 2014-06-10 | 350 |
| 2014-06-11 | 350 |
| 2014-06-12 | 350 |
| 2014-06-13 | 350 |
| 2014-06-16 | 350 |
| 2014-06-17 | 350 |
| 2014-06-18 | 350 |
| 2014-06-19 | 350 |
| 2014-06-20 | 350 |
| 2014-06-23 | 350 |
| 2014-06-24 | 350 |
| 2014-06-25 | 350 |
| 2014-06-26 | 350 |
| 2014-06-27 | 350 |
| 2014-06-30 | 350 |
| 2014-07-01 | 350 |
| 2014-07-02 | 350 |
| 2014-07-03 | 350 |
| 2014-07-07 | 350 |
| 2014-07-08 | 350 |
| 2014-07-09 | 350 |
| 2014-07-10 | 350 |
| 2014-07-11 | 350 |
| 2014-07-14 | 350 |
| 2014-07-15 | 350 |
| 2014-07-16 | 350 |
| 2014-07-17 | 350 |
| 2014-07-18 | 350 |
| 2014-07-21 | 350 |
| 2014-07-22 | 350 |
| 2014-07-23 | 350 |
| 2014-07-24 | 350 |
| 2014-07-25 | 350 |
| 2014-07-28 | 350 |
| 2014-07-29 | 350 |
| 2014-07-30 | 350 |
| 2014-07-31 | 350 |
| 2014-08-01 | 350 |
| 2014-08-04 | 350 |
| 2014-08-05 | 350 |
| 2014-08-06 | 350 |
| 2014-08-07 | 350 |
| 2014-08-08 | 350 |
| 2014-08-11 | 350 |
| 2014-08-12 | 350 |
| 2014-08-13 | 350 |
| 2014-08-14 | 350 |
| 2014-08-15 | 350 |
| 2014-08-18 | 350 |
| 2014-08-19 | 350 |
| 2014-08-20 | 350 |
| 2014-08-21 | 350 |
| 2014-08-22 | 350 |
| 2014-08-25 | 350 |
| 2014-08-26 | 350 |
| 2014-08-27 | 350 |
| 2014-08-28 | 350 |
| 2014-08-29 | 350 |
| 2014-09-01 | 350 |
| 2014-09-02 | 350 |
| 2014-09-03 | 350 |
| 2014-09-04 | 350 |
| 2014-09-05 | 350 |
| 2014-09-08 | 350 |
| 2014-09-09 | 350 |
| 2014-09-10 | 350 |
| 2014-09-11 | 350 |
| 2014-09-12 | 350 |
| 2014-09-13 | 350 |
| 2014-09-14 | 350 |
| 2014-09-15 | 350 |
| 2014-09-16 | 350 |
| 2014-09-17 | 350 |
| 2014-09-18 | 350 |
| 2014-09-19 | 350 |
| 2014-09-20 | 350 |
| 2014-09-21 | 350 |
| 2014-09-22 | 350 |
| 2014-09-23 | 350 |
| 2014-09-24 | 350 |
| 2014-09-25 | 350 |
| 2014-09-26 | 350 |
| 2014-09-27 | 350 |
| 2014-09-28 | 350 |
| 2014-09-29 | 350 |
| 2014-09-30 | 350 |
| 2014-10-01 | 350 |
| 2014-10-02 | 350 |
| 2014-10-03 | 350 |
| 2014-10-04 | 350 |
| 2014-10-05 | 350 |
| 2014-10-06 | 350 |
| 2014-10-07 | 350 |
| 2014-10-08 | 350 |
| 2014-10-09 | 350 |
| 2014-10-10 | 350 |
| 2014-10-11 | 350 |
| 2014-10-12 | 350 |
| 2014-10-13 | 350 |
| 2014-10-14 | 350 |
| 2014-10-15 | 350 |
| 2014-10-16 | 350 |
| 2014-10-17 | 350 |
| 2014-10-18 | 350 |
| 2014-10-19 | 350 |
| 2014-10-20 | 350 |
| 2014-10-21 | 350 |
| 2014-10-22 | 350 |
| 2014-10-23 | 350 |
| 2014-10-24 | 350 |
| 2014-10-25 | 350 |
| 2014-10-26 | 350 |
| 2014-10-27 | 350 |
| 2014-10-28 | 350 |
| 2014-10-29 | 350 |
| 2014-10-30 | 350 |
| 2014-10-31 | 350 |
| 2014-11-01 | 350 |
| 2014-11-02 | 350 |
| 2014-11-03 | 350 |
| 2014-11-04 | 350 |
| 2014-11-05 | 350 |
| 2014-11-06 | 350 |
| 2014-11-07 | 350 |
| 2014-11-08 | 350 |
| 2014-11-09 | 350 |
| 2014-11-10 | 350 |
| 2014-11-11 | 350 |
| 2014-11-12 | 350 |
| 2014-11-13 | 350 |
| 2014-11-14 | 350 |
| 2014-11-15 | 350 |
| 2014-11-16 | 350 |
| 2014-11-17 | 350 |
| 2014-11-18 | 350 |
| 2014-11-19 | 350 |
| 2014-11-20 | 350 |
| 2014-11-21 | 350 |
| 2014-11-22 | 350 |
| 2014-11-23 | 350 |
| 2014-11-24 | 350 |
| 2014-11-25 | 350 |
| 2014-11-26 | 350 |
| 2014-11-27 | 350 |
| 2014-11-28 | 350 |
| 2014-11-29 | 350 |
| 2014-11-30 | 350 |
| 2014-12-01 | 350 |
| 2014-12-02 | 350 |
| 2014-12-03 | 350 |
| 2014-12-04 | 350 |
| 2014-12-05 | 350 |
| 2014-12-06 | 350 |
| 2014-12-07 | 350 |
| 2014-12-08 | 350 |
| 2014-12-09 | 350 |
| 2014-12-10 | 350 |
| 2014-12-11 | 350 |
| 2014-12-12 | 350 |
| 2014-12-13 | 350 |
| 2014-12-14 | 350 |
| 2014-12-15 | 350 |
| 2014-12-16 | 350 |
| 2014-12-17 | 350 |
| 2014-12-18 | 350 |
| 2014-12-19 | 350 |
| 2014-12-20 | 350 |
| 2014-12-21 | 350 |
| 2014-12-22 | 350 |
| 2014-12-23 | 350 |
| 2014-12-24 | 350 |
| 2014-12-25 | 350 |
| 2014-12-26 | 350 |
| 2014-12-27 | 350 |
| 2014-12-28 | 350 |
| 2014-12-29 | 350 |
| 2014-12-30 | 350 |
| 2014-12-31 | 350 |
| 2015-01-01 | 350 |
| 2015-01-02 | 350 |
| 2015-01-03 | 350 |
| 2015-01-04 | 350 |
| 2015-01-05 | 350 |
| 2015-01-06 | 350 |
| 2015-01-07 | 350 |
| 2015-01-08 | 350 |
| 2015-01-09 | 350 |
| 2015-01-10 | 350 |
| 2015-01-11 | 350 |
| 2015-01-12 | 350 |
| 2015-01-13 | 350 |
| 2015-01-14 | 350 |
| 2015-01-15 | 350 |
| 2015-01-16 | 350 |
| 2015-01-17 | 350 |
| 2015-01-18 | 350 |
| 2015-01-19 | 350 |
| 2015-01-20 | 350 |
| 2015-01-21 | 350 |
| 2015-01-22 | 350 |
| 2015-01-23 | 350 |
| 2015-01-24 | 350 |
| 2015-01-25 | 350 |
| 2015-01-26 | 350 |
| 2015-01-27 | 350 |
| 2015-01-28 | 350 |
| 2015-01-29 | 350 |
| 2015-01-30 | 350 |
| 2015-01-31 | 350 |
| 2015-02-01 | 350 |
| 2015-02-02 | 350 |
| 2015-02-03 | 350 |
| 2015-02-04 | 350 |
| 2015-02-05 | 350 |
| 2015-02-06 | 350 |
| 2015-02-07 | 350 |
| 2015-02-08 | 350 |
| 2015-02-09 | 350 |
| 2015-02-10 | 350 |
| 2015-02-11 | 350 |
| 2015-02-12 | 350 |
| 2015-02-13 | 350 |
| 2015-02-14 | 350 |
| 2015-02-15 | 350 |
| 2015-02-16 | 350 |
| 2015-02-17 | 350 |
| 2015-02-18 | 350 |
| 2015-02-19 | 350 |
| 2015-02-20 | 350 |
| 2015-02-21 | 350 |
| 2015-02-22 | 350 |
| 2015-02-23 | 350 |
| 2015-02-24 | 350 |
| 2015-02-25 | 350 |
| 2015-02-26 | 350 |
| 2015-02-27 | 350 |
| 2015-02-28 | 350 |
| 2015-03-01 | 350 |
| 2015-03-02 | 350 |
| 2015-03-03 | 350 |
| 2015-03-04 | 350 |
| 2015-03-05 | 350 |
| 2015-03-06 | 350 |
| 2015-03-07 | 350 |
| 2015-03-08 | 350 |
| 2015-03-09 | 350 |
| 2015-03-10 | 350 |
| 2015-03-11 | 350 |
| 2015-03-12 | 350 |
| 2015-03-13 | 350 |
| 2015-03-14 | 350 |
| 2015-03-15 | 350 |
| 2015-03-16 | 350 |
| 2015-03-17 | 350 |
| 2015-03-18 | 350 |
| 2015-03-19 | 350 |
| 2015-03-20 | 350 |
| 2015-03-21 | 350 |
| 2015-03-22 | 350 |
| 2015-03-23 | 350 |
| 2015-03-24 | 350 |
| 2015-03-25 | 350 |
| 2015-03-26 | 350 |
| 2015-03-27 | 350 |
| 2015-03-28 | 350 |
| 2015-03-29 | 350 |
| 2015-03-30 | 350 |
| 2015-03-31 | 350 |
| 2015-04-01 | 350 |
| 2015-04-02 | 350 |
| 2015-04-03 | 350 |
| 2015-04-04 | 350 |
| 2015-04-05 | 350 |
| 2015-04-06 | 350 |
| 2015-04-07 | 350 |
| 2015-04-08 | 350 |
| 2015-04-09 | 350 |
| 2015-04-10 | 350 |
| 2015-04-11 | 350 |
| 2015-04-12 | 350 |
| 2015-04-13 | 350 |
| 2015-04-14 | 350 |
| 2015-04-15 | 350 |
| 2015-04-16 | 350 |
| 2015-04-17 | 350 |
| 2015-04-18 | 350 |
| 2015-04-19 | 350 |
| 2015-04-20 | 350 |
| 2015-04-21 | 350 |
| 2015-04-22 | 350 |
| 2015-04-23 | 350 |
| 2015-04-24 | 350 |
| 2015-04-25 | 350 |
| 2015-04-26 | 350 |
| 2015-04-27 | 350 |
| 2015-04-28 | 350 |
| 2015-04-29 | 350 |
| 2015-04-30 | 350 |
| 2015-05-01 | 350 |
| 2015-05-02 | 350 |
| 2015-05-03 | 350 |
| 2015-05-04 | 350 |
| 2015-05-05 | 350 |
| 2015-05-06 | 350 |
| 2015-05-07 | 350 |
| 2015-05-08 | 350 |
| 2015-05-09 | 350 |
| 2015-05-10 | 350 |
| 2015-05-11 | 350 |
| 2015-05-12 | 350 |
| 2015-05-13 | 350 |
| 2015-05-14 | 350 |
| 2015-05-15 | 350 |
| 2015-05-16 | 350 |
| 2015-05-17 | 350 |
| 2015-05-18 | 350 |
| 2015-05-19 | 350 |
| 2015-05-20 | 350 |
| 2015-05-21 | 350 |
| 2015-05-22 | 350 |
| 2015-05-23 | 350 |
| 2015-05-24 | 350 |
| 2015-05-25 | 350 |
| 2015-05-26 | 350 |
| 2015-05-27 | 350 |
| 2015-05-28 | 350 |
| 2015-05-29 | 350 |
| 2015-05-30 | 350 |
| 2015-05-31 | 350 |
| 2015-06-01 | 350 |
| 2015-06-02 | 350 |
| 2015-06-03 | 350 |
| 2015-06-04 | 350 |
| 2015-06-05 | 350 |
| 2015-06-06 | 350 |
| 2015-06-07 | 350 |
| 2015-06-08 | 350 |
| 2015-06-09 | 350 |
| 2015-06-10 | 350 |
| 2015-06-11 | 350 |
| 2015-06-12 | 350 |
| 2015-06-13 | 350 |
| 2015-06-14 | 350 |
| 2015-06-15 | 350 |
| 2015-06-16 | 350 |
| 2015-06-17 | 350 |
| 2015-06-18 | 350 |
| 2015-06-19 | 350 |
| 2015-06-20 | 350 |
| 2015-06-21 | 350 |
| 2015-06-22 | 350 |
| 2015-06-23 | 350 |
| 2015-06-24 | 350 |
| 2015-06-25 | 350 |
| 2015-06-26 | 350 |
| 2015-06-27 | 350 |
| 2015-06-28 | 350 |
| 2015-06-29 | 350 |
| 2015-06-30 | 350 |
| 2015-07-01 | 350 |
| 2015-07-02 | 350 |
| 2015-07-03 | 350 |
| 2015-07-04 | 350 |
| 2015-07-05 | 350 |
| 2015-07-06 | 350 |
| 2015-07-07 | 350 |
| 2015-07-08 | 350 |
| 2015-07-09 | 350 |
| 2015-07-10 | 350 |
| 2015-07-11 | 350 |
| 2015-07-12 | 350 |
| 2015-07-13 | 350 |
| 2015-07-14 | 350 |
| 2015-07-15 | 350 |
| 2015-07-16 | 350 |
| 2015-07-17 | 350 |
| 2015-07-18 | 350 |
| 2015-07-19 | 350 |
| 2015-07-20 | 350 |
| 2015-07-21 | 350 |
| 2015-07-22 | 350 |
| 2015-07-23 | 350 |
| 2015-07-24 | 350 |
| 2015-07-25 | 350 |
| 2015-07-26 | 350 |
| 2015-07-27 | 350 |
| 2015-07-28 | 350 |
| 2015-07-29 | 350 |
| 2015-07-30 | 350 |
| 2015-07-31 | 350 |
| 2015-08-01 | 350 |
| 2015-08-02 | 350 |
| 2015-08-03 | 350 |
| 2015-08-04 | 350 |
| 2015-08-05 | 350 |
| 2015-08-06 | 350 |
| 2015-08-07 | 350 |
| 2015-08-08 | 350 |
| 2015-08-09 | 350 |
| 2015-08-10 | 350 |
| 2015-08-11 | 350 |
| 2015-08-12 | 350 |
| 2015-08-13 | 350 |
| 2015-08-14 | 350 |
| 2015-08-15 | 350 |
| 2015-08-16 | 350 |
| 2015-08-17 | 350 |
| 2015-08-18 | 350 |
| 2015-08-19 | 350 |
| 2015-08-20 | 350 |
| 2015-08-21 | 350 |
| 2015-08-22 | 350 |
| 2015-08-23 | 350 |
| 2015-08-24 | 350 |
| 2015-08-25 | 350 |
| 2015-08-26 | 350 |
| 2015-08-27 | 350 |
| 2015-08-28 | 350 |
| 2015-08-29 | 350 |
| 2015-08-30 | 350 |
| 2015-08-31 | 350 |
| 2015-09-01 | 350 |
| 2015-09-02 | 350 |
| 2015-09-03 | 350 |
| 2015-09-04 | 350 |
| 2015-09-05 | 350 |
| 2015-09-06 | 350 |
| 2015-09-07 | 350 |
| 2015-09-08 | 350 |
| 2015-09-09 | 350 |
| 2015-09-10 | 350 |
| 2015-09-11 | 350 |
| 2015-09-12 | 350 |
| 2015-09-13 | 350 |
| 2015-09-14 | 350 |
| 2015-09-15 | 350 |
| 2015-09-16 | 350 |
| 2015-09-17 | 350 |
| 2015-09-18 | 350 |
| 2015-09-19 | 350 |
| 2015-09-20 | 350 |
| 2015-09-21 | 350 |
| 2015-09-22 | 350 |
| 2015-09-23 | 350 |
| 2015-09-24 | 350 |
| 2015-09-25 | 350 |
| 2015-09-26 | 350 |
| 2015-09-27 | 350 |
| 2015-09-28 | 350 |
| 2015-09-29 | 350 |
| 2015-09-30 | 350 |
| 2015-10-01 | 350 |
| 2015-10-02 | 350 |
| 2015-10-03 | 350 |
| 2015-10-04 | 350 |
| 2015-10-05 | 350 |
| 2015-10-06 | 350 |
| 2015-10-07 | 350 |
| 2015-10-08 | 350 |
| 2015-10-09 | 350 |
| 2015-10-10 | 350 |
| 2015-10-11 | 350 |
| 2015-10-12 | 350 |
| 2015-10-13 | 350 |
| 2015-10-14 | 350 |
| 2015-10-15 | 350 |
| 2015-10-16 | 350 |
| 2015-10-17 | 350 |
| 2015-10-18 | 350 |
| 2015-10-19 | 350 |
| 2015-10-20 | 350 |
| 2015-10-21 | 350 |
| 2015-10-22 | 350 |
| 2015-10-23 | 350 |
| 2015-10-24 | 350 |
| 2015-10-25 | 350 |
| 2015-10-26 | 350 |
| 2015-10-27 | 350 |
| 2015-10-28 | 350 |
| 2015-10-29 | 350 |
| 2015-10-30 | 350 |
| 2015-10-31 | 350 |
| 2015-11-01 | 350 |
| 2015-11-02 | 350 |
| 2015-11-03 | 350 |
| 2015-11-04 | 350 |
| 2015-11-05 | 350 |
| 2015-11-06 | 350 |
| 2015-11-07 | 350 |
| 2015-11-08 | 350 |
| 2015-11-09 | 350 |
| 2015-11-10 | 350 |
| 2015-11-11 | 350 |
| 2015-11-12 | 350 |
| 2015-11-13 | 350 |
| 2015-11-14 | 350 |
| 2015-11-15 | 350 |
| 2015-11-16 | 350 |
| 2015-11-17 | 350 |
| 2015-11-18 | 350 |
| 2015-11-19 | 350 |
| 2015-11-20 | 350 |
| 2015-11-21 | 350 |
| 2015-11-22 | 350 |
| 2015-11-23 | 350 |
| 2015-11-24 | 350 |
| 2015-11-25 | 350 |
| 2015-11-26 | 350 |
| 2015-11-27 | 350 |
| 2015-11-28 | 350 |
| 2015-11-29 | 350 |
| 2015-11-30 | 350 |
| 2015-12-01 | 350 |
| 2015-12-02 | 350 |
| 2015-12-03 | 350 |
| 2015-12-04 | 350 |
| 2015-12-05 | 350 |
| 2015-12-06 | 350 |
| 2015-12-07 | 350 |
| 2015-12-08 | 350 |
| 2015-12-09 | 350 |
| 2015-12-10 | 350 |
| 2015-12-11 | 350 |
| 2015-12-12 | 350 |
| 2015-12-13 | 350 |
| 2015-12-14 | 350 |
| 2015-12-15 | 350 |
| 2015-12-16 | 350 |
| 2015-12-17 | 350 |
| 2015-12-18 | 350 |
| 2015-12-19 | 350 |
| 2015-12-20 | 350 |
| 2015-12-21 | 350 |
| 2015-12-22 | 350 |
| 2015-12-23 | 350 |
| 2015-12-24 | 350 |
| 2015-12-25 | 350 |
| 2015-12-26 | 350 |
| 2015-12-27 | 350 |
| 2015-12-28 | 350 |
| 2015-12-29 | 350 |
| 2015-12-30 | 350 |
| 2015-12-31 | 350 |
| 2016-01-01 | 350 |
| 2016-01-02 | 350 |
| 2016-01-03 | 350 |
| 2016-01-04 | 350 |
| 2016-01-05 | 350 |
| 2016-01-06 | 350 |
| 2016-01-07 | 350 |
| 2016-01-08 | 350 |
| 2016-01-09 | 350 |
| 2016-01-10 | 350 |
| 2016-01-11 | 350 |
| 2016-01-12 | 350 |
| 2016-01-13 | 350 |
| 2016-01-14 | 350 |
| 2016-01-15 | 350 |
| 2016-01-16 | 350 |
| 2016-01-17 | 350 |
| 2016-01-18 | 350 |
| 2016-01-19 | 350 |
| 2016-01-20 | 350 |
| 2016-01-21 | 350 |
| 2016-01-22 | 350 |
| 2016-01-23 | 350 |
| 2016-01-24 | 350 |
| 2016-01-25 | 350 |
| 2016-01-26 | 350 |
| 2016-01-27 | 350 |
| 2016-01-28 | 350 |
| 2016-01-29 | 350 |
| 2016-01-30 | 350 |
| 2016-01-31 | 350 |
| 2016-02-01 | 350 |
| 2016-02-02 | 350 |
| 2016-02-03 | 350 |
| 2016-02-04 | 350 |
| 2016-02-05 | 350 |
| 2016-02-06 | 350 |
| 2016-02-07 | 350 |
| 2016-02-08 | 350 |
| 2016-02-09 | 350 |
| 2016-02-10 | 350 |
| 2016-02-11 | 350 |
| 2016-02-12 | 350 |
| 2016-02-13 | 350 |
| 2016-02-14 | 350 |
| 2016-02-15 | 350 |
| 2016-02-16 | 450 |
| 2016-02-17 | 450 |
| 2016-02-18 | 450 |
| 2016-02-19 | 450 |
| 2016-02-20 | 450 |
| 2016-02-21 | 450 |
| 2016-02-22 | 450 |
| 2016-02-23 | 450 |
| 2016-02-24 | 450 |
| 2016-02-25 | 450 |
| 2016-02-26 | 450 |
| 2016-02-27 | 450 |
| 2016-02-28 | 450 |
| 2016-02-29 | 450 |
| 2016-03-01 | 450 |
| 2016-03-02 | 450 |
| 2016-03-03 | 450 |
| 2016-03-04 | 450 |
| 2016-03-05 | 450 |
| 2016-03-06 | 450 |
| 2016-03-07 | 450 |
| 2016-03-08 | 450 |
| 2016-03-09 | 450 |
| 2016-03-10 | 450 |
| 2016-03-11 | 450 |
| 2016-03-12 | 450 |
| 2016-03-13 | 450 |
| 2016-03-14 | 450 |
| 2016-03-15 | 450 |
| 2016-03-16 | 450 |
| 2016-03-17 | 450 |
| 2016-03-18 | 450 |
| 2016-03-19 | 450 |
| 2016-03-20 | 450 |
| 2016-03-21 | 450 |
| 2016-03-22 | 450 |
| 2016-03-23 | 450 |
| 2016-03-24 | 450 |
| 2016-03-25 | 450 |
| 2016-03-26 | 450 |
| 2016-03-27 | 450 |
| 2016-03-28 | 450 |
| 2016-03-29 | 450 |
| 2016-03-30 | 450 |
| 2016-03-31 | 450 |
| 2016-04-01 | 450 |
| 2016-04-02 | 450 |
| 2016-04-03 | 450 |
| 2016-04-04 | 450 |
| 2016-04-05 | 450 |
| 2016-04-06 | 450 |
| 2016-04-07 | 450 |
| 2016-04-08 | 450 |
| 2016-04-09 | 450 |
| 2016-04-10 | 450 |
| 2016-04-11 | 450 |
| 2016-04-12 | 450 |
| 2016-04-13 | 450 |
| 2016-04-14 | 450 |
| 2016-04-15 | 450 |
| 2016-04-16 | 450 |
| 2016-04-17 | 450 |
| 2016-04-18 | 450 |
| 2016-04-19 | 450 |
| 2016-04-20 | 450 |
| 2016-04-21 | 450 |
| 2016-04-22 | 450 |
| 2016-04-23 | 450 |
| 2016-04-24 | 450 |
| 2016-04-25 | 450 |
| 2016-04-26 | 450 |
| 2016-04-27 | 450 |
| 2016-04-28 | 450 |
| 2016-04-29 | 450 |
| 2016-04-30 | 450 |
| 2016-05-01 | 450 |
| 2016-05-02 | 450 |
| 2016-05-03 | 450 |
| 2016-05-04 | 450 |
| 2016-05-05 | 450 |
| 2016-05-06 | 450 |
| 2016-05-07 | 450 |
| 2016-05-08 | 450 |
| 2016-05-09 | 450 |
| 2016-05-10 | 450 |
| 2016-05-11 | 450 |
| 2016-05-12 | 450 |
| 2016-05-13 | 450 |
| 2016-05-14 | 450 |
| 2016-05-15 | 450 |
| 2016-05-16 | 450 |
| 2016-05-17 | 450 |
| 2016-05-18 | 450 |
| 2016-05-19 | 450 |
| 2016-05-20 | 450 |
| 2016-05-21 | 450 |
| 2016-05-22 | 450 |
| 2016-05-23 | 450 |
| 2016-05-24 | 450 |
| 2016-05-25 | 450 |
| 2016-05-26 | 450 |
| 2016-05-27 | 450 |
| 2016-05-28 | 450 |
| 2016-05-29 | 450 |
| 2016-05-30 | 450 |
| 2016-05-31 | 450 |
| 2016-06-01 | 450 |
| 2016-06-02 | 450 |
| 2016-06-03 | 450 |
| 2016-06-04 | 450 |
| 2016-06-05 | 450 |
| 2016-06-06 | 450 |
| 2016-06-07 | 450 |
| 2016-06-08 | 450 |
| 2016-06-09 | 450 |
| 2016-06-10 | 450 |
| 2016-06-11 | 450 |
| 2016-06-12 | 450 |
| 2016-06-13 | 450 |
| 2016-06-14 | 450 |
| 2016-06-15 | 450 |
| 2016-06-16 | 450 |
| 2016-06-17 | 450 |
| 2016-06-18 | 450 |
| 2016-06-19 | 450 |
| 2016-06-20 | 450 |
| 2016-06-21 | 450 |
| 2016-06-22 | 450 |
| 2016-06-23 | 450 |
| 2016-06-24 | 450 |
| 2016-06-25 | 450 |
| 2016-06-26 | 450 |
| 2016-06-27 | 450 |
| 2016-06-28 | 450 |
| 2016-06-29 | 450 |
| 2016-06-30 | 450 |
| 2016-07-01 | 450 |
| 2016-07-02 | 450 |
| 2016-07-03 | 450 |
| 2016-07-04 | 450 |
| 2016-07-05 | 450 |
| 2016-07-06 | 450 |
| 2016-07-07 | 450 |
| 2016-07-08 | 450 |
| 2016-07-09 | 450 |
| 2016-07-10 | 450 |
| 2016-07-11 | 450 |
| 2016-07-12 | 450 |
| 2016-07-13 | 450 |
| 2016-07-14 | 450 |
| 2016-07-15 | 450 |
| 2016-07-16 | 450 |
| 2016-07-17 | 450 |
| 2016-07-18 | 450 |
| 2016-07-19 | 450 |
| 2016-07-20 | 450 |
| 2016-07-21 | 450 |
| 2016-07-22 | 450 |
| 2016-07-23 | 450 |
| 2016-07-24 | 450 |
| 2016-07-25 | 450 |
| 2016-07-26 | 450 |
| 2016-07-27 | 450 |
| 2016-07-28 | 450 |
| 2016-07-29 | 450 |
| 2016-07-30 | 450 |
| 2016-07-31 | 450 |
| 2016-08-01 | 450 |
| 2016-08-02 | 450 |
| 2016-08-03 | 450 |
| 2016-08-04 | 450 |
| 2016-08-05 | 450 |
| 2016-08-06 | 450 |
| 2016-08-07 | 450 |
| 2016-08-08 | 450 |
| 2016-08-09 | 450 |
| 2016-08-10 | 450 |
| 2016-08-11 | 450 |
| 2016-08-12 | 450 |
| 2016-08-13 | 450 |
| 2016-08-14 | 450 |
| 2016-08-15 | 450 |
| 2016-08-16 | 450 |
| 2016-08-17 | 450 |
| 2016-08-18 | 450 |
| 2016-08-19 | 450 |
| 2016-08-20 | 450 |
| 2016-08-21 | 450 |
| 2016-08-22 | 450 |
| 2016-08-23 | 450 |
| 2016-08-24 | 450 |
| 2016-08-25 | 450 |
| 2016-08-26 | 450 |
| 2016-08-27 | 450 |
| 2016-08-28 | 450 |
| 2016-08-29 | 450 |
| 2016-08-30 | 450 |
| 2016-08-31 | 450 |
| 2016-09-01 | 450 |
| 2016-09-02 | 450 |
| 2016-09-03 | 450 |
| 2016-09-04 | 450 |
| 2016-09-05 | 450 |
| 2016-09-06 | 450 |
| 2016-09-07 | 450 |
| 2016-09-08 | 450 |
| 2016-09-09 | 450 |
| 2016-09-10 | 450 |
| 2016-09-11 | 450 |
| 2016-09-12 | 450 |
| 2016-09-13 | 450 |
| 2016-09-14 | 450 |
| 2016-09-15 | 450 |
| 2016-09-16 | 450 |
| 2016-09-17 | 450 |
| 2016-09-18 | 450 |
| 2016-09-19 | 450 |
| 2016-09-20 | 450 |
| 2016-09-21 | 450 |
| 2016-09-22 | 450 |
| 2016-09-23 | 450 |
| 2016-09-24 | 450 |
| 2016-09-25 | 450 |
| 2016-09-26 | 450 |
| 2016-09-27 | 450 |
| 2016-09-28 | 450 |
| 2016-09-29 | 450 |
| 2016-09-30 | 450 |
| 2016-10-01 | 450 |
| 2016-10-02 | 450 |
| 2016-10-03 | 450 |
| 2016-10-04 | 450 |
| 2016-10-05 | 450 |
| 2016-10-06 | 450 |
| 2016-10-07 | 450 |
| 2016-10-08 | 450 |
| 2016-10-09 | 450 |
| 2016-10-10 | 450 |
| 2016-10-11 | 450 |
| 2016-10-12 | 450 |
| 2016-10-13 | 450 |
| 2016-10-14 | 450 |
| 2016-10-15 | 450 |
| 2016-10-16 | 450 |
| 2016-10-17 | 450 |
| 2016-10-18 | 450 |
| 2016-10-19 | 450 |
| 2016-10-20 | 450 |
| 2016-10-21 | 450 |
| 2016-10-22 | 450 |
| 2016-10-23 | 450 |
| 2016-10-24 | 450 |
| 2016-10-25 | 450 |
| 2016-10-26 | 450 |
| 2016-10-27 | 450 |
| 2016-10-28 | 450 |
| 2016-10-29 | 450 |
| 2016-10-30 | 450 |
| 2016-10-31 | 450 |
| 2016-11-01 | 450 |
| 2016-11-02 | 450 |
| 2016-11-03 | 450 |
| 2016-11-04 | 450 |
| 2016-11-05 | 450 |
| 2016-11-06 | 450 |
| 2016-11-07 | 450 |
| 2016-11-08 | 450 |
| 2016-11-09 | 450 |
| 2016-11-10 | 450 |
| 2016-11-11 | 450 |
| 2016-11-12 | 450 |
| 2016-11-13 | 450 |
| 2016-11-14 | 450 |
| 2016-11-15 | 450 |
| 2016-11-16 | 450 |
| 2016-11-17 | 450 |
| 2016-11-18 | 450 |
| 2016-11-19 | 450 |
| 2016-11-20 | 450 |
| 2016-11-21 | 450 |
| 2016-11-22 | 450 |
| 2016-11-23 | 450 |
| 2016-11-24 | 450 |
| 2016-11-25 | 450 |
| 2016-11-26 | 450 |
| 2016-11-27 | 450 |
| 2016-11-28 | 450 |
| 2016-11-29 | 450 |
| 2016-11-30 | 450 |
| 2016-12-01 | 450 |
| 2016-12-02 | 450 |
| 2016-12-03 | 450 |
| 2016-12-04 | 450 |
| 2016-12-05 | 450 |
| 2016-12-06 | 450 |
| 2016-12-07 | 450 |
| 2016-12-08 | 450 |
| 2016-12-09 | 450 |
| 2016-12-10 | 450 |
| 2016-12-11 | 450 |
| 2016-12-12 | 450 |
| 2016-12-13 | 450 |
| 2016-12-14 | 450 |
| 2016-12-15 | 450 |
| 2016-12-16 | 450 |
| 2016-12-17 | 450 |
| 2016-12-18 | 450 |
| 2016-12-19 | 450 |
| 2016-12-20 | 450 |
| 2016-12-21 | 450 |
| 2016-12-22 | 450 |
| 2016-12-23 | 450 |
| 2016-12-24 | 450 |
| 2016-12-25 | 450 |
| 2016-12-26 | 450 |
| 2016-12-27 | 450 |
| 2016-12-28 | 450 |
| 2016-12-29 | 450 |
| 2016-12-30 | 450 |
| 2016-12-31 | 450 |
| 2017-01-01 | 450 |
| 2017-01-02 | 450 |
| 2017-01-03 | 450 |
| 2017-01-04 | 450 |
| 2017-01-05 | 450 |
| 2017-01-06 | 450 |
| 2017-01-07 | 450 |
| 2017-01-08 | 450 |
| 2017-01-09 | 450 |
| 2017-01-10 | 450 |
| 2017-01-11 | 450 |
| 2017-01-12 | 450 |
| 2017-01-13 | 450 |
| 2017-01-14 | 450 |
| 2017-01-15 | 450 |
| 2017-01-16 | 450 |
| 2017-01-17 | 450 |
| 2017-01-18 | 450 |
| 2017-01-19 | 450 |
| 2017-01-20 | 450 |
| 2017-01-21 | 450 |
| 2017-01-22 | 450 |
| 2017-01-23 | 450 |
| 2017-01-24 | 450 |
| 2017-01-25 | 450 |
| 2017-01-26 | 450 |
| 2017-01-27 | 450 |
| 2017-01-28 | 450 |
| 2017-01-29 | 450 |
| 2017-01-30 | 450 |
| 2017-01-31 | 450 |
| 2017-02-01 | 450 |
| 2017-02-02 | 450 |
| 2017-02-03 | 450 |
| 2017-02-04 | 450 |
| 2017-02-05 | 450 |
| 2017-02-06 | 450 |
| 2017-02-07 | 450 |
| 2017-02-08 | 450 |
| 2017-02-09 | 450 |
| 2017-02-10 | 450 |
| 2017-02-11 | 450 |
| 2017-02-12 | 450 |
| 2017-02-13 | 450 |
| 2017-02-14 | 450 |
| 2017-02-15 | 450 |
| 2017-02-16 | 450 |
| 2017-02-17 | 450 |
| 2017-02-18 | 450 |
| 2017-02-19 | 450 |
| 2017-02-20 | 450 |
| 2017-02-21 | 450 |
| 2017-02-22 | 450 |
| 2017-02-23 | 450 |
| 2017-02-24 | 450 |
| 2017-02-25 | 450 |
| 2017-02-26 | 450 |
| 2017-02-27 | 450 |
| 2017-02-28 | 450 |
| 2017-03-01 | 450 |
| 2017-03-02 | 450 |
| 2017-03-03 | 450 |
| 2017-03-04 | 450 |
| 2017-03-05 | 450 |
| 2017-03-06 | 450 |
| 2017-03-07 | 450 |
| 2017-03-08 | 450 |
| 2017-03-09 | 450 |
| 2017-03-10 | 450 |
| 2017-03-11 | 450 |
| 2017-03-12 | 450 |
| 2017-03-13 | 450 |
| 2017-03-14 | 450 |
| 2017-03-15 | 450 |
| 2017-03-16 | 450 |
| 2017-03-17 | 450 |
| 2017-03-18 | 450 |
| 2017-03-19 | 450 |
| 2017-03-20 | 450 |
| 2017-03-21 | 450 |
| 2017-03-22 | 450 |
| 2017-03-23 | 450 |
| 2017-03-24 | 450 |
| 2017-03-25 | 450 |
| 2017-03-26 | 450 |
| 2017-03-27 | 450 |
| 2017-03-28 | 450 |
| 2017-03-29 | 450 |
| 2017-03-30 | 450 |
| 2017-03-31 | 450 |
| 2017-04-01 | 450 |
| 2017-04-02 | 450 |
| 2017-04-03 | 450 |
| 2017-04-04 | 450 |
| 2017-04-05 | 450 |
| 2017-04-06 | 450 |
| 2017-04-07 | 450 |
| 2017-04-08 | 450 |
| 2017-04-09 | 450 |
| 2017-04-10 | 450 |
| 2017-04-11 | 450 |
| 2017-04-12 | 450 |
| 2017-04-13 | 450 |
| 2017-04-14 | 450 |
| 2017-04-15 | 450 |
| 2017-04-16 | 450 |
| 2017-04-17 | 450 |
| 2017-04-18 | 450 |
| 2017-04-19 | 450 |
| 2017-04-20 | 450 |
| 2017-04-21 | 450 |
| 2017-04-22 | 450 |
| 2017-04-23 | 450 |
| 2017-04-24 | 450 |
| 2017-04-25 | 450 |
| 2017-04-26 | 450 |
| 2017-04-27 | 450 |
| 2017-04-28 | 450 |
| 2017-04-29 | 450 |
| 2017-04-30 | 450 |
| 2017-05-01 | 450 |
| 2017-05-02 | 450 |
| 2017-05-03 | 450 |
| 2017-05-04 | 450 |
| 2017-05-05 | 450 |
| 2017-05-06 | 450 |
| 2017-05-07 | 450 |
| 2017-05-08 | 450 |
| 2017-05-09 | 450 |
| 2017-05-10 | 450 |
| 2017-05-11 | 450 |
| 2017-05-12 | 450 |
| 2017-05-13 | 450 |
| 2017-05-14 | 450 |
| 2017-05-15 | 450 |
| 2017-05-16 | 450 |
| 2017-05-17 | 450 |
| 2017-05-18 | 450 |
| 2017-05-19 | 450 |
| 2017-05-20 | 450 |
| 2017-05-21 | 450 |
| 2017-05-22 | 450 |
| 2017-05-23 | 450 |
| 2017-05-24 | 450 |
| 2017-05-25 | 450 |
| 2017-05-26 | 450 |
| 2017-05-27 | 450 |
| 2017-05-28 | 450 |
| 2017-05-29 | 450 |
| 2017-05-30 | 450 |
| 2017-05-31 | 450 |
| 2017-06-01 | 450 |
| 2017-06-02 | 450 |
| 2017-06-03 | 450 |
| 2017-06-04 | 450 |
| 2017-06-05 | 450 |
| 2017-06-06 | 450 |
| 2017-06-07 | 450 |
| 2017-06-08 | 450 |
| 2017-06-09 | 450 |
| 2017-06-10 | 450 |
| 2017-06-11 | 450 |
| 2017-06-12 | 450 |
| 2017-06-13 | 450 |
| 2017-06-14 | 450 |
| 2017-06-15 | 450 |
| 2017-06-16 | 450 |
| 2017-06-17 | 450 |
| 2017-06-18 | 450 |
| 2017-06-19 | 450 |
| 2017-06-20 | 450 |
| 2017-06-21 | 450 |
| 2017-06-22 | 450 |
| 2017-06-23 | 450 |
| 2017-06-24 | 450 |
| 2017-06-25 | 450 |
| 2017-06-26 | 450 |
| 2017-06-27 | 450 |
| 2017-06-28 | 450 |
| 2017-06-29 | 450 |
| 2017-06-30 | 450 |
| 2017-07-01 | 450 |
| 2017-07-02 | 450 |
| 2017-07-03 | 450 |
| 2017-07-04 | 450 |
| 2017-07-05 | 450 |
| 2017-07-06 | 450 |
| 2017-07-07 | 450 |
| 2017-07-08 | 450 |
| 2017-07-09 | 450 |
| 2017-07-10 | 450 |
| 2017-07-11 | 450 |
| 2017-07-12 | 450 |
| 2017-07-13 | 450 |
| 2017-07-14 | 450 |
| 2017-07-15 | 450 |
| 2017-07-16 | 450 |
| 2017-07-17 | 450 |
| 2017-07-18 | 450 |
| 2017-07-19 | 450 |
| 2017-07-20 | 450 |
| 2017-07-21 | 450 |
| 2017-07-22 | 450 |
| 2017-07-23 | 450 |
| 2017-07-24 | 450 |
| 2017-07-25 | 450 |
| 2017-07-26 | 450 |
| 2017-07-27 | 450 |
| 2017-07-28 | 450 |
| 2017-07-29 | 450 |
| 2017-07-30 | 450 |
| 2017-07-31 | 450 |
| 2017-08-01 | 450 |
| 2017-08-02 | 450 |
| 2017-08-03 | 450 |
| 2017-08-04 | 450 |
| 2017-08-05 | 450 |
| 2017-08-06 | 450 |
| 2017-08-07 | 450 |
| 2017-08-08 | 450 |
| 2017-08-09 | 450 |
| 2017-08-10 | 450 |
| 2017-08-11 | 450 |
| 2017-08-12 | 450 |
| 2017-08-13 | 450 |
| 2017-08-14 | 450 |
| 2017-08-15 | 450 |
| 2017-08-16 | 450 |
| 2017-08-17 | 450 |
| 2017-08-18 | 450 |
| 2017-08-19 | 450 |
| 2017-08-20 | 450 |
| 2017-08-21 | 450 |
| 2017-08-22 | 450 |
| 2017-08-23 | 450 |
| 2017-08-24 | 450 |
| 2017-08-25 | 450 |
| 2017-08-26 | 450 |
| 2017-08-27 | 450 |
| 2017-08-28 | 450 |
| 2017-08-29 | 450 |
| 2017-08-30 | 450 |
| 2017-08-31 | 450 |
| 2017-09-01 | 450 |
| 2017-09-02 | 450 |
| 2017-09-03 | 450 |
| 2017-09-04 | 450 |
| 2017-09-05 | 450 |
| 2017-09-06 | 450 |
| 2017-09-07 | 450 |
| 2017-09-08 | 450 |
| 2017-09-09 | 450 |
| 2017-09-10 | 450 |
| 2017-09-11 | 450 |
| 2017-09-12 | 450 |
| 2017-09-13 | 450 |
| 2017-09-14 | 450 |
| 2017-09-15 | 450 |
| 2017-09-16 | 450 |
| 2017-09-17 | 450 |
| 2017-09-18 | 450 |
| 2017-09-19 | 450 |
| 2017-09-20 | 450 |
| 2017-09-21 | 450 |
| 2017-09-22 | 450 |
| 2017-09-23 | 450 |
| 2017-09-24 | 450 |
| 2017-09-25 | 450 |
| 2017-09-26 | 450 |
| 2017-09-27 | 450 |
| 2017-09-28 | 450 |
| 2017-09-29 | 450 |
| 2017-09-30 | 450 |
| 2017-10-01 | 450 |
| 2017-10-02 | 450 |
| 2017-10-03 | 450 |
| 2017-10-04 | 450 |
| 2017-10-05 | 450 |
| 2017-10-06 | 450 |
| 2017-10-07 | 450 |
| 2017-10-08 | 450 |
| 2017-10-09 | 450 |
| 2017-10-10 | 450 |
| 2017-10-11 | 450 |
| 2017-10-12 | 450 |
| 2017-10-13 | 450 |
| 2017-10-14 | 450 |
| 2017-10-15 | 450 |
| 2017-10-16 | 450 |
| 2017-10-17 | 450 |
| 2017-10-18 | 450 |
| 2017-10-19 | 450 |
| 2017-10-20 | 450 |
| 2017-10-21 | 450 |
| 2017-10-22 | 450 |
| 2017-10-23 | 450 |
| 2017-10-24 | 450 |
| 2017-10-25 | 450 |
| 2017-10-26 | 450 |
| 2017-10-27 | 450 |
| 2017-10-28 | 450 |
| 2017-10-29 | 450 |
| 2017-10-30 | 450 |
| 2017-10-31 | 450 |
| 2017-11-01 | 450 |
| 2017-11-02 | 450 |
| 2017-11-03 | 450 |
| 2017-11-04 | 450 |
| 2017-11-05 | 450 |
| 2017-11-06 | 450 |
| 2017-11-07 | 450 |
| 2017-11-08 | 450 |
| 2017-11-09 | 450 |
| 2017-11-10 | 450 |
| 2017-11-11 | 450 |
| 2017-11-12 | 450 |
| 2017-11-13 | 450 |
| 2017-11-14 | 450 |
| 2017-11-15 | 450 |
| 2017-11-16 | 450 |
| 2017-11-17 | 450 |
| 2017-11-18 | 450 |
| 2017-11-19 | 450 |
| 2017-11-20 | 450 |
| 2017-11-21 | 450 |
| 2017-11-22 | 450 |
| 2017-11-23 | 450 |
| 2017-11-24 | 450 |
| 2017-11-25 | 450 |
| 2017-11-26 | 450 |
| 2017-11-27 | 450 |
| 2017-11-28 | 450 |
| 2017-11-29 | 450 |
| 2017-11-30 | 450 |
| 2017-12-01 | 450 |
| 2017-12-02 | 450 |
| 2017-12-03 | 450 |
| 2017-12-04 | 450 |
| 2017-12-05 | 450 |
| 2017-12-06 | 450 |
| 2017-12-07 | 450 |
| 2017-12-08 | 450 |
| 2017-12-09 | 450 |
| 2017-12-10 | 450 |
| 2017-12-11 | 450 |
| 2017-12-12 | 450 |
| 2017-12-13 | 450 |
| 2017-12-14 | 450 |
| 2017-12-15 | 450 |
| 2017-12-16 | 450 |
| 2017-12-17 | 450 |
| 2017-12-18 | 450 |
| 2017-12-19 | 450 |
| 2017-12-20 | 450 |
| 2017-12-21 | 450 |
| 2017-12-22 | 450 |
| 2017-12-23 | 450 |
| 2017-12-24 | 450 |
| 2017-12-25 | 450 |
| 2017-12-26 | 450 |
| 2017-12-27 | 450 |
| 2017-12-28 | 330 |
| 2017-12-29 | 330 |
| 2017-12-30 | 330 |
| 2017-12-31 | 330 |
| 2018-01-01 | 330 |
| 2018-01-02 | 330 |
| 2018-01-03 | 330 |
| 2018-01-04 | 330 |
| 2018-01-05 | 330 |
| 2018-01-06 | 330 |
| 2018-01-07 | 330 |
| 2018-01-08 | 330 |
| 2018-01-09 | 330 |
| 2018-01-10 | 330 |
| 2018-01-11 | 330 |
| 2018-01-12 | 330 |
| 2018-01-13 | 330 |
| 2018-01-14 | 330 |
| 2018-01-15 | 330 |
| 2018-01-16 | 330 |
| 2018-01-17 | 330 |
| 2018-01-18 | 330 |
| 2018-01-19 | 330 |
| 2018-01-20 | 330 |
| 2018-01-21 | 330 |
| 2018-01-22 | 330 |
| 2018-01-23 | 330 |
| 2018-01-24 | 330 |
| 2018-01-25 | 330 |
| 2018-01-26 | 330 |
| 2018-01-27 | 330 |
| 2018-01-28 | 330 |
| 2018-01-29 | 330 |
| 2018-01-30 | 330 |
| 2018-01-31 | 330 |
| 2018-02-01 | 330 |
| 2018-02-02 | 330 |
| 2018-02-03 | 330 |
| 2018-02-04 | 330 |
| 2018-02-05 | 330 |
| 2018-02-06 | 330 |
| 2018-02-07 | 330 |
| 2018-02-08 | 330 |
| 2018-02-09 | 330 |
| 2018-02-10 | 330 |
| 2018-02-11 | 330 |
| 2018-02-12 | 330 |
| 2018-02-13 | 330 |
| 2018-02-14 | 330 |
| 2018-02-15 | 330 |
| 2018-02-16 | 330 |
| 2018-02-17 | 330 |
| 2018-02-18 | 330 |
| 2018-02-19 | 330 |
| 2018-02-20 | 330 |
| 2018-02-21 | 330 |
| 2018-02-22 | 330 |
| 2018-02-23 | 330 |
| 2018-02-24 | 330 |
| 2018-02-25 | 330 |
| 2018-02-26 | 330 |
| 2018-02-27 | 330 |
| 2018-02-28 | 330 |
| 2018-03-01 | 330 |
| 2018-03-02 | 330 |
| 2018-03-03 | 330 |
| 2018-03-04 | 330 |
| 2018-03-05 | 330 |
| 2018-03-06 | 330 |
| 2018-03-07 | 330 |
| 2018-03-08 | 330 |
| 2018-03-09 | 330 |
| 2018-03-10 | 330 |
| 2018-03-11 | 330 |
| 2018-03-12 | 330 |
| 2018-03-13 | 330 |
| 2018-03-14 | 330 |
| 2018-03-15 | 330 |
| 2018-03-16 | 330 |
| 2018-03-17 | 330 |
| 2018-03-18 | 330 |
| 2018-03-19 | 330 |
| 2018-03-20 | 330 |
| 2018-03-21 | 330 |
| 2018-03-22 | 330 |
| 2018-03-23 | 330 |
| 2018-03-24 | 330 |
| 2018-03-25 | 330 |
| 2018-03-26 | 330 |
| 2018-03-27 | 330 |
| 2018-03-28 | 330 |
| 2018-03-29 | 330 |
| 2018-03-30 | 330 |
| 2018-03-31 | 330 |
| 2018-04-01 | 330 |
| 2018-04-02 | 330 |
| 2018-04-03 | 330 |
| 2018-04-04 | 330 |
| 2018-04-05 | 330 |
| 2018-04-06 | 330 |
| 2018-04-07 | 330 |
| 2018-04-08 | 330 |
| 2018-04-09 | 330 |
| 2018-04-10 | 330 |
| 2018-04-11 | 330 |
| 2018-04-12 | 330 |
| 2018-04-13 | 330 |
| 2018-04-14 | 330 |
| 2018-04-15 | 330 |
| 2018-04-16 | 330 |
| 2018-04-17 | 330 |
| 2018-04-18 | 330 |
| 2018-04-19 | 330 |
| 2018-04-20 | 330 |
| 2018-04-21 | 330 |
| 2018-04-22 | 330 |
| 2018-04-23 | 330 |
| 2018-04-24 | 330 |
| 2018-04-25 | 330 |
| 2018-04-26 | 330 |
| 2018-04-27 | 330 |
| 2018-04-28 | 330 |
| 2018-04-29 | 330 |
| 2018-04-30 | 330 |
| 2018-05-01 | 330 |
| 2018-05-02 | 330 |
| 2018-05-03 | 330 |
| 2018-05-04 | 330 |
| 2018-05-05 | 330 |
| 2018-05-06 | 330 |
| 2018-05-07 | 330 |
| 2018-05-08 | 330 |
| 2018-05-09 | 330 |
| 2018-05-10 | 330 |
| 2018-05-11 | 330 |
| 2018-05-12 | 330 |
| 2018-05-13 | 330 |
| 2018-05-14 | 330 |
| 2018-05-15 | 330 |
| 2018-05-16 | 500 |
| 2018-05-17 | 500 |
| 2018-05-18 | 500 |
| 2018-05-19 | 500 |
| 2018-05-20 | 500 |
| 2018-05-21 | 500 |
| 2018-05-22 | 500 |
| 2018-05-23 | 500 |
| 2018-05-24 | 500 |
| 2018-05-25 | 500 |
| 2018-05-26 | 500 |
| 2018-05-27 | 500 |
| 2018-05-28 | 500 |
| 2018-05-29 | 500 |
| 2018-05-30 | 500 |
| 2018-05-31 | 500 |
| 2018-06-01 | 500 |
| 2018-06-02 | 500 |
| 2018-06-03 | 500 |
| 2018-06-04 | 500 |
| 2018-06-05 | 500 |
| 2018-06-06 | 500 |
| 2018-06-07 | 500 |
| 2018-06-08 | 500 |
| 2018-06-09 | 500 |
| 2018-06-10 | 500 |
| 2018-06-11 | 500 |
| 2018-06-12 | 500 |
| 2018-06-13 | 500 |
| 2018-06-14 | 500 |
| 2018-06-15 | 500 |
| 2018-06-16 | 500 |
| 2018-06-17 | 500 |
| 2018-06-18 | 500 |
| 2018-06-19 | 500 |
| 2018-06-20 | 500 |
| 2018-06-21 | 500 |
| 2018-06-22 | 500 |
| 2018-06-23 | 500 |
| 2018-06-24 | 500 |
| 2018-06-25 | 500 |
| 2018-06-26 | 500 |
| 2018-06-27 | 500 |
| 2018-06-28 | 500 |
| 2018-06-29 | 500 |
| 2018-06-30 | 500 |
| 2018-07-01 | 500 |
| 2018-07-02 | 500 |
| 2018-07-03 | 500 |
| 2018-07-04 | 500 |
| 2018-07-05 | 500 |
| 2018-07-06 | 500 |
| 2018-07-07 | 500 |
| 2018-07-08 | 500 |
| 2018-07-09 | 500 |
| 2018-07-10 | 500 |
| 2018-07-11 | 500 |
| 2018-07-12 | 500 |
| 2018-07-13 | 500 |
| 2018-07-14 | 500 |
| 2018-07-15 | 500 |
| 2018-07-16 | 500 |
| 2018-07-17 | 500 |
| 2018-07-18 | 500 |
| 2018-07-19 | 500 |
| 2018-07-20 | 500 |
| 2018-07-21 | 500 |
| 2018-07-22 | 500 |
| 2018-07-23 | 500 |
| 2018-07-24 | 500 |
| 2018-07-25 | 500 |
| 2018-07-26 | 500 |
| 2018-07-27 | 500 |
| 2018-07-28 | 500 |
| 2018-07-29 | 500 |
| 2018-07-30 | 500 |
| 2018-07-31 | 500 |
| 2018-08-01 | 500 |
| 2018-08-02 | 500 |
| 2018-08-03 | 500 |
| 2018-08-04 | 500 |
| 2018-08-05 | 500 |
| 2018-08-06 | 500 |
| 2018-08-07 | 500 |
| 2018-08-08 | 500 |
| 2018-08-09 | 500 |
| 2018-08-10 | 500 |
| 2018-08-11 | 500 |
| 2018-08-12 | 500 |
| 2018-08-13 | 500 |
| 2018-08-14 | 500 |
| 2018-08-15 | 500 |
| 2018-08-16 | 500 |
| 2018-08-17 | 500 |
| 2018-08-18 | 500 |
| 2018-08-19 | 500 |
| 2018-08-20 | 500 |
| 2018-08-21 | 500 |
| 2018-08-22 | 500 |
| 2018-08-23 | 500 |
| 2018-08-24 | 500 |
| 2018-08-25 | 500 |
| 2018-08-26 | 500 |
| 2018-08-27 | 500 |
| 2018-08-28 | 500 |
| 2018-08-29 | 500 |
| 2018-08-30 | 500 |
| 2018-08-31 | 500 |
| 2018-09-01 | 500 |
| 2018-09-02 | 500 |
| 2018-09-03 | 500 |
| 2018-09-04 | 500 |
| 2018-09-05 | 500 |
| 2018-09-06 | 500 |
| 2018-09-07 | 500 |
| 2018-09-08 | 500 |
| 2018-09-09 | 500 |
| 2018-09-10 | 500 |
| 2018-09-11 | 500 |
| 2018-09-12 | 500 |
| 2018-09-13 | 500 |
| 2018-09-14 | 500 |
| 2018-09-15 | 500 |
| 2018-09-16 | 500 |
| 2018-09-17 | 500 |
| 2018-09-18 | 500 |
| 2018-09-19 | 500 |
| 2018-09-20 | 500 |
| 2018-09-21 | 500 |
| 2018-09-22 | 500 |
| 2018-09-23 | 500 |
| 2018-09-24 | 500 |
| 2018-09-25 | 500 |
| 2018-09-26 | 500 |
| 2018-09-27 | 500 |
| 2018-09-28 | 500 |
| 2018-09-29 | 500 |
| 2018-09-30 | 500 |
| 2018-10-01 | 500 |
| 2018-10-02 | 500 |
| 2018-10-03 | 500 |
| 2018-10-04 | 500 |
| 2018-10-05 | 500 |
| 2018-10-06 | 500 |
| 2018-10-07 | 500 |
| 2018-10-08 | 500 |
| 2018-10-09 | 500 |
| 2018-10-10 | 500 |
| 2018-10-11 | 500 |
| 2018-10-12 | 500 |
| 2018-10-13 | 500 |
| 2018-10-14 | 500 |
| 2018-10-15 | 500 |
| 2018-10-16 | 500 |
| 2018-10-17 | 500 |
| 2018-10-18 | 500 |
| 2018-10-19 | 500 |
| 2018-10-20 | 500 |
| 2018-10-21 | 500 |
| 2018-10-22 | 500 |
| 2018-10-23 | 500 |
| 2018-10-24 | 500 |
| 2018-10-25 | 450 |
| 2018-10-26 | 450 |
| 2018-10-27 | 450 |
| 2018-10-28 | 450 |
| 2018-10-29 | 450 |
| 2018-10-30 | 450 |
| 2018-10-31 | 450 |
| 2018-11-01 | 450 |
| 2018-11-02 | 450 |
| 2018-11-03 | 450 |
| 2018-11-04 | 450 |
| 2018-11-05 | 450 |
| 2018-11-06 | 450 |
| 2018-11-07 | 450 |
| 2018-11-08 | 450 |
| 2018-11-09 | 450 |
| 2018-11-10 | 450 |
| 2018-11-11 | 450 |
| 2018-11-12 | 450 |
| 2018-11-13 | 450 |
| 2018-11-14 | 450 |
| 2018-11-15 | 450 |
| 2018-11-16 | 450 |
| 2018-11-17 | 450 |
| 2018-11-18 | 450 |
| 2018-11-19 | 450 |
| 2018-11-20 | 450 |
| 2018-11-21 | 450 |
| 2018-11-22 | 450 |
| 2018-11-23 | 450 |
| 2018-11-24 | 450 |
| 2018-11-25 | 450 |
| 2018-11-26 | 450 |
| 2018-11-27 | 450 |
| 2018-11-28 | 450 |
| 2018-11-29 | 450 |
| 2018-11-30 | 450 |
| 2018-12-01 | 450 |
| 2018-12-02 | 450 |
| 2018-12-03 | 450 |
| 2018-12-04 | 450 |
| 2018-12-05 | 450 |
| 2018-12-06 | 450 |
| 2018-12-07 | 450 |
| 2018-12-08 | 450 |
| 2018-12-09 | 450 |
| 2018-12-10 | 450 |
| 2018-12-11 | 450 |
| 2018-12-12 | 450 |
| 2018-12-13 | 450 |
| 2018-12-14 | 450 |
| 2018-12-15 | 450 |
| 2018-12-16 | 450 |
| 2018-12-17 | 450 |
| 2018-12-18 | 450 |
| 2018-12-19 | 450 |
| 2018-12-20 | 450 |
| 2018-12-21 | 450 |
| 2018-12-22 | 450 |
| 2018-12-23 | 450 |
| 2018-12-24 | 450 |
| 2018-12-25 | 450 |
| 2018-12-26 | 450 |
| 2018-12-27 | 450 |
| 2018-12-28 | 450 |
| 2018-12-29 | 450 |
| 2018-12-30 | 450 |
| 2018-12-31 | 450 |
| 2019-01-01 | 450 |
| 2019-01-02 | 450 |
| 2019-01-03 | 450 |
| 2019-01-04 | 450 |
| 2019-01-05 | 450 |
| 2019-01-06 | 450 |
| 2019-01-07 | 450 |
| 2019-01-08 | 450 |
| 2019-01-09 | 450 |
| 2019-01-10 | 450 |
| 2019-01-11 | 450 |
| 2019-01-12 | 450 |
| 2019-01-13 | 450 |
| 2019-01-14 | 450 |
| 2019-01-15 | 450 |
| 2019-01-16 | 450 |
| 2019-01-17 | 450 |
| 2019-01-18 | 450 |
| 2019-01-19 | 450 |
| 2019-01-20 | 450 |
| 2019-01-21 | 450 |
| 2019-01-22 | 450 |
| 2019-01-23 | 450 |
| 2019-01-24 | 450 |
| 2019-01-25 | 450 |
| 2019-01-26 | 450 |
| 2019-01-27 | 450 |
| 2019-01-28 | 450 |
| 2019-01-29 | 450 |
| 2019-01-30 | 450 |
| 2019-01-31 | 450 |
| 2019-02-01 | 450 |
| 2019-02-02 | 450 |
| 2019-02-03 | 450 |
| 2019-02-04 | 450 |
| 2019-02-05 | 450 |
| 2019-02-06 | 450 |
| 2019-02-07 | 450 |
| 2019-02-08 | 450 |
| 2019-02-09 | 450 |
| 2019-02-10 | 450 |
| 2019-02-11 | 450 |
| 2019-02-12 | 450 |
| 2019-02-13 | 450 |
| 2019-02-14 | 450 |
| 2019-02-15 | 450 |
| 2019-02-16 | 450 |
| 2019-02-17 | 450 |
| 2019-02-18 | 450 |
| 2019-02-19 | 450 |
| 2019-02-20 | 450 |
| 2019-02-21 | 450 |
| 2019-02-22 | 450 |
| 2019-02-23 | 450 |
| 2019-02-24 | 450 |
| 2019-02-25 | 450 |
| 2019-02-26 | 450 |
| 2019-02-27 | 450 |
| 2019-02-28 | 450 |
| 2019-03-01 | 450 |
| 2019-03-02 | 450 |
| 2019-03-03 | 450 |
| 2019-03-04 | 450 |
| 2019-03-05 | 450 |
| 2019-03-06 | 450 |
| 2019-03-07 | 450 |
| 2019-03-08 | 450 |
| 2019-03-09 | 450 |
| 2019-03-10 | 450 |
| 2019-03-11 | 450 |
| 2019-03-12 | 450 |
| 2019-03-13 | 450 |
| 2019-03-14 | 450 |
| 2019-03-15 | 450 |
| 2019-03-16 | 450 |
| 2019-03-17 | 450 |
| 2019-03-18 | 450 |
| 2019-03-19 | 450 |
| 2019-03-20 | 450 |
| 2019-03-21 | 450 |
| 2019-03-22 | 450 |
| 2019-03-23 | 450 |
| 2019-03-24 | 450 |
| 2019-03-25 | 450 |
| 2019-03-26 | 450 |
| 2019-03-27 | 450 |
| 2019-03-28 | 450 |
| 2019-03-29 | 450 |
| 2019-03-30 | 450 |
| 2019-03-31 | 450 |
| 2019-04-01 | 450 |
| 2019-04-02 | 450 |
| 2019-04-03 | 450 |
| 2019-04-04 | 450 |
| 2019-04-05 | 450 |
| 2019-04-06 | 450 |
| 2019-04-07 | 450 |
| 2019-04-08 | 450 |
| 2019-04-09 | 450 |
| 2019-04-10 | 450 |
| 2019-04-11 | 450 |
| 2019-04-12 | 450 |
| 2019-04-13 | 450 |
| 2019-04-14 | 450 |
| 2019-04-15 | 450 |
| 2019-04-16 | 450 |
| 2019-04-17 | 450 |
| 2019-04-18 | 450 |
| 2019-04-19 | 450 |
| 2019-04-20 | 450 |
| 2019-04-21 | 450 |
| 2019-04-22 | 450 |
| 2019-04-23 | 450 |
| 2019-04-24 | 450 |
| 2019-04-25 | 450 |
| 2019-04-26 | 450 |
| 2019-04-27 | 450 |
| 2019-04-28 | 450 |
| 2019-04-29 | 450 |
| 2019-04-30 | 450 |
| 2019-05-01 | 450 |
| 2019-05-02 | 450 |
| 2019-05-03 | 450 |
| 2019-05-04 | 450 |
| 2019-05-05 | 450 |
| 2019-05-06 | 450 |
| 2019-05-07 | 450 |
| 2019-05-08 | 450 |
| 2019-05-09 | 450 |
| 2019-05-10 | 450 |
| 2019-05-11 | 450 |
| 2019-05-12 | 450 |
| 2019-05-13 | 450 |
| 2019-05-14 | 450 |
| 2019-05-15 | 450 |
| 2019-05-16 | 450 |
| 2019-05-17 | 450 |
| 2019-05-18 | 450 |
| 2019-05-19 | 450 |
| 2019-05-20 | 450 |
| 2019-05-21 | 450 |
| 2019-05-22 | 450 |
| 2019-05-23 | 450 |
| 2019-05-24 | 450 |
| 2019-05-25 | 450 |
| 2019-05-26 | 450 |
| 2019-05-27 | 450 |
| 2019-05-28 | 450 |
| 2019-05-29 | 450 |
| 2019-05-30 | 450 |
| 2019-05-31 | 450 |
| 2019-06-01 | 450 |
| 2019-06-02 | 450 |
| 2019-06-03 | 450 |
| 2019-06-04 | 450 |
| 2019-06-05 | 450 |
| 2019-06-06 | 450 |
| 2019-06-07 | 450 |
| 2019-06-08 | 450 |
| 2019-06-09 | 450 |
| 2019-06-10 | 450 |
| 2019-06-11 | 450 |
| 2019-06-12 | 450 |
| 2019-06-13 | 450 |
| 2019-06-14 | 450 |
| 2019-06-15 | 450 |
| 2019-06-16 | 450 |
| 2019-06-17 | 450 |
| 2019-06-18 | 450 |
| 2019-06-19 | 450 |
| 2019-06-20 | 450 |
| 2019-06-21 | 450 |
| 2019-06-22 | 450 |
| 2019-06-23 | 450 |
| 2019-06-24 | 450 |
| 2019-06-25 | 450 |
| 2019-06-26 | 450 |
| 2019-06-27 | 450 |
| 2019-06-28 | 450 |
| 2019-06-29 | 450 |
| 2019-06-30 | 450 |
| 2019-07-01 | 450 |
| 2019-07-02 | 450 |
| 2019-07-03 | 450 |
| 2019-07-04 | 450 |
| 2019-07-05 | 450 |
| 2019-07-06 | 450 |
| 2019-07-07 | 450 |
| 2019-07-08 | 450 |
| 2019-07-09 | 450 |
| 2019-07-10 | 450 |
| 2019-07-11 | 450 |
| 2019-07-12 | 450 |
| 2019-07-13 | 450 |
| 2019-07-14 | 450 |
| 2019-07-15 | 450 |
| 2019-07-16 | 450 |
| 2019-07-17 | 450 |
| 2019-07-18 | 450 |
| 2019-07-19 | 450 |
| 2019-07-20 | 450 |
| 2019-07-21 | 450 |
| 2019-07-22 | 450 |
| 2019-07-23 | 450 |
| 2019-07-24 | 450 |
| 2019-07-25 | 450 |
| 2019-07-26 | 450 |
| 2019-07-27 | 450 |
| 2019-07-28 | 450 |
| 2019-07-29 | 450 |
| 2019-07-30 | 450 |
| 2019-07-31 | 450 |
| 2019-08-01 | 450 |
| 2019-08-02 | 450 |
| 2019-08-03 | 450 |
| 2019-08-04 | 450 |
| 2019-08-05 | 450 |
| 2019-08-06 | 450 |
| 2019-08-07 | 450 |
| 2019-08-08 | 450 |
| 2019-08-09 | 450 |
| 2019-08-10 | 450 |
| 2019-08-11 | 450 |
| 2019-08-12 | 450 |
| 2019-08-13 | 450 |
| 2019-08-14 | 450 |
| 2019-08-15 | 450 |
| 2019-08-16 | 450 |
| 2019-08-17 | 450 |
| 2019-08-18 | 450 |
| 2019-08-19 | 450 |
| 2019-08-20 | 450 |
| 2019-08-21 | 450 |
| 2019-08-22 | 450 |
| 2019-08-23 | 450 |
| 2019-08-24 | 450 |
| 2019-08-25 | 450 |
| 2019-08-26 | 450 |
| 2019-08-27 | 450 |
| 2019-08-28 | 450 |
| 2019-08-29 | 450 |
| 2019-08-30 | 450 |
| 2019-08-31 | 450 |
| 2019-09-01 | 450 |
| 2019-09-02 | 450 |
| 2019-09-03 | 450 |
| 2019-09-04 | 450 |
| 2019-09-05 | 450 |
| 2019-09-06 | 450 |
| 2019-09-07 | 450 |
| 2019-09-08 | 450 |
| 2019-09-09 | 450 |
| 2019-09-10 | 450 |
| 2019-09-11 | 450 |
| 2019-09-12 | 450 |
| 2019-09-13 | 450 |
| 2019-09-14 | 450 |
| 2019-09-15 | 450 |
| 2019-09-16 | 450 |
| 2019-09-17 | 450 |
| 2019-09-18 | 450 |
| 2019-09-19 | 450 |
| 2019-09-20 | 450 |
| 2019-09-21 | 450 |
| 2019-09-22 | 450 |
| 2019-09-23 | 450 |
| 2019-09-24 | 450 |
| 2019-09-25 | 450 |
| 2019-09-26 | 450 |
| 2019-09-27 | 450 |
| 2019-09-28 | 450 |
| 2019-09-29 | 450 |
| 2019-09-30 | 450 |
| 2019-10-01 | 450 |
| 2019-10-02 | 450 |
| 2019-10-03 | 450 |
| 2019-10-04 | 450 |
| 2019-10-05 | 450 |
| 2019-10-06 | 450 |
| 2019-10-07 | 450 |
| 2019-10-08 | 450 |
| 2019-10-09 | 450 |
| 2019-10-10 | 450 |
| 2019-10-11 | 450 |
| 2019-10-12 | 450 |
| 2019-10-13 | 450 |
| 2019-10-14 | 450 |
| 2019-10-15 | 450 |
| 2019-10-16 | 450 |
| 2019-10-17 | 450 |
| 2019-10-18 | 450 |
| 2019-10-19 | 450 |
| 2019-10-20 | 450 |
| 2019-10-21 | 450 |
| 2019-10-22 | 450 |
| 2019-10-23 | 450 |
| 2019-10-24 | 450 |
| 2019-10-25 | 450 |
| 2019-10-26 | 450 |
| 2019-10-27 | 450 |
| 2019-10-28 | 450 |
| 2019-10-29 | 450 |
| 2019-10-30 | 450 |
| 2019-10-31 | 450 |
| 2019-11-01 | 450 |
| 2019-11-02 | 450 |
| 2019-11-03 | 450 |
| 2019-11-04 | 450 |
| 2019-11-05 | 450 |
| 2019-11-06 | 450 |
| 2019-11-07 | 450 |
| 2019-11-08 | 450 |
| 2019-11-09 | 450 |
| 2019-11-10 | 450 |
| 2019-11-11 | 450 |
| 2019-11-12 | 290 |
| 2019-11-13 | 290 |
| 2019-11-14 | 290 |
| 2019-11-15 | 290 |
| 2019-11-16 | 290 |
| 2019-11-17 | 290 |
| 2019-11-18 | 290 |
| 2019-11-19 | 290 |
| 2019-11-20 | 290 |
| 2019-11-21 | 300 |
| 2019-11-22 | 300 |
| 2019-11-23 | 300 |
| 2019-11-24 | 300 |
| 2019-11-25 | 300 |
| 2019-11-26 | 300 |
| 2019-11-27 | 300 |
| 2019-11-28 | 300 |
| 2019-11-29 | 300 |
| 2019-11-30 | 300 |
| 2019-12-01 | 300 |
| 2019-12-02 | 300 |
| 2019-12-03 | 300 |
| 2019-12-04 | 300 |
| 2019-12-05 | 300 |
| 2019-12-06 | 300 |
| 2019-12-07 | 300 |
| 2019-12-08 | 300 |
| 2019-12-09 | 300 |
| 2019-12-10 | 300 |
| 2019-12-11 | 300 |
| 2019-12-12 | 300 |
| 2019-12-13 | 300 |
| 2019-12-14 | 300 |
| 2019-12-15 | 300 |
| 2019-12-16 | 300 |
| 2019-12-17 | 300 |
| 2019-12-18 | 300 |
| 2019-12-19 | 300 |
| 2019-12-20 | 300 |
| 2019-12-21 | 300 |
| 2019-12-22 | 300 |
| 2019-12-23 | 300 |
| 2019-12-24 | 300 |
| 2019-12-25 | 300 |
| 2019-12-26 | 300 |
| 2019-12-27 | 300 |
| 2019-12-28 | 300 |
| 2019-12-29 | 300 |
| 2019-12-30 | 300 |
| 2019-12-31 | 300 |
| 2020-01-01 | 300 |
| 2020-01-02 | 300 |
| 2020-01-03 | 300 |
| 2020-01-04 | 300 |
| 2020-01-05 | 300 |
| 2020-01-06 | 300 |
| 2020-01-07 | 300 |
| 2020-01-08 | 300 |
| 2020-01-09 | 300 |
| 2020-01-10 | 300 |
| 2020-01-11 | 300 |
| 2020-01-12 | 300 |
| 2020-01-13 | 300 |
| 2020-01-14 | 300 |
| 2020-01-15 | 300 |
| 2020-01-16 | 300 |
| 2020-01-17 | 300 |
| 2020-01-18 | 300 |
| 2020-01-19 | 300 |
| 2020-01-20 | 300 |
| 2020-01-21 | 300 |
| 2020-01-22 | 300 |
| 2020-01-23 | 300 |
| 2020-01-24 | 300 |
| 2020-01-25 | 300 |
| 2020-01-26 | 300 |
| 2020-01-27 | 300 |
| 2020-01-28 | 300 |
| 2020-01-29 | 300 |
| 2020-01-30 | 300 |
| 2020-01-31 | 300 |
| 2020-02-01 | 300 |
| 2020-02-02 | 300 |
| 2020-02-03 | 300 |
| 2020-02-04 | 300 |
| 2020-02-05 | 300 |
| 2020-02-06 | 300 |
| 2020-02-07 | 300 |
| 2020-02-08 | 300 |
| 2020-02-09 | 300 |
| 2020-02-10 | 300 |
| 2020-02-11 | 300 |
| 2020-02-12 | 300 |
| 2020-02-13 | 300 |
| 2020-02-14 | 300 |
| 2020-02-15 | 300 |
| 2020-02-16 | 300 |
| 2020-02-17 | 300 |
| 2020-02-18 | 300 |
| 2020-02-19 | 300 |
| 2020-02-20 | 300 |
| 2020-02-21 | 300 |
| 2020-02-22 | 300 |
| 2020-02-23 | 300 |
| 2020-02-24 | 300 |
| 2020-02-25 | 300 |
| 2020-02-26 | 300 |
| 2020-02-27 | 300 |
| 2020-02-28 | 300 |
| 2020-02-29 | 300 |
| 2020-03-01 | 300 |
| 2020-03-02 | 300 |
| 2020-03-03 | 300 |
| 2020-03-04 | 300 |
| 2020-03-05 | 300 |
| 2020-03-06 | 300 |
| 2020-03-07 | 300 |
| 2020-03-08 | 300 |
| 2020-03-09 | 300 |
| 2020-03-10 | 300 |
| 2020-03-11 | 300 |
| 2020-03-12 | 300 |
| 2020-03-13 | 300 |
| 2020-03-14 | 300 |
| 2020-03-15 | 300 |
| 2020-03-16 | 300 |
| 2020-03-17 | 300 |
| 2020-03-18 | 300 |
| 2020-03-19 | 300 |
| 2020-03-20 | 300 |
| 2020-03-21 | 300 |
| 2020-03-22 | 300 |
| 2020-03-23 | 300 |
| 2020-03-24 | 300 |
| 2020-03-25 | 300 |
| 2020-03-26 | 300 |
| 2020-03-27 | 300 |
| 2020-03-28 | 300 |
| 2020-03-29 | 300 |
| 2020-03-30 | 300 |
| 2020-03-31 | 300 |
| 2020-04-01 | 300 |
| 2020-04-02 | 300 |
| 2020-04-03 | 300 |
| 2020-04-04 | 300 |
| 2020-04-05 | 300 |
| 2020-04-06 | 300 |
| 2020-04-07 | 300 |
| 2020-04-08 | 300 |
| 2020-04-09 | 300 |
| 2020-04-10 | 300 |
| 2020-04-11 | 300 |
| 2020-04-12 | 300 |
| 2020-04-13 | 300 |
| 2020-04-14 | 300 |
| 2020-04-15 | 300 |
| 2020-04-16 | 300 |
| 2020-04-17 | 300 |
| 2020-04-18 | 300 |
| 2020-04-19 | 300 |
| 2020-04-20 | 300 |
| 2020-04-21 | 300 |
| 2020-04-22 | 300 |
| 2020-04-23 | 300 |
| 2020-04-24 | 300 |
| 2020-04-25 | 300 |
| 2020-04-26 | 300 |
| 2020-04-27 | 300 |
| 2020-04-28 | 300 |
| 2020-04-29 | 300 |
| 2020-04-30 | 300 |
| 2020-05-01 | 300 |
| 2020-05-02 | 300 |
| 2020-05-03 | 300 |
| 2020-05-04 | 300 |
| 2020-05-05 | 300 |
| 2020-05-06 | 300 |
| 2020-05-07 | 300 |
| 2020-05-08 | 300 |
| 2020-05-09 | 300 |
| 2020-05-10 | 300 |
| 2020-05-11 | 300 |
| 2020-05-12 | 300 |
| 2020-05-13 | 300 |
| 2020-05-14 | 300 |
| 2020-05-15 | 300 |
| 2020-05-16 | 300 |
| 2020-05-17 | 300 |
| 2020-05-18 | 300 |
| 2020-05-19 | 300 |
| 2020-05-20 | 300 |
| 2020-05-21 | 300 |
| 2020-05-22 | 300 |
| 2020-05-23 | 300 |
| 2020-05-24 | 300 |
| 2020-05-25 | 300 |
| 2020-05-26 | 300 |
| 2020-05-27 | 300 |
| 2020-05-28 | 300 |
| 2020-05-29 | 300 |
| 2020-05-30 | 300 |
| 2020-05-31 | 300 |
| 2020-06-01 | 300 |
| 2020-06-02 | 300 |
| 2020-06-03 | 300 |
| 2020-06-04 | 300 |
| 2020-06-05 | 300 |
| 2020-06-06 | 300 |
| 2020-06-07 | 300 |
| 2020-06-08 | 300 |
| 2020-06-09 | 300 |
| 2020-06-10 | 300 |
| 2020-06-11 | 300 |
| 2020-06-12 | 300 |
| 2020-06-13 | 300 |
| 2020-06-14 | 300 |
| 2020-06-15 | 300 |
| 2020-06-16 | 300 |
| 2020-06-17 | 300 |
| 2020-06-18 | 300 |
| 2020-06-19 | 300 |
| 2020-06-20 | 300 |
| 2020-06-21 | 300 |
| 2020-06-22 | 300 |
| 2020-06-23 | 300 |
| 2020-06-24 | 300 |
| 2020-06-25 | 300 |
| 2020-06-26 | 300 |
| 2020-06-27 | 300 |
| 2020-06-28 | 300 |
| 2020-06-29 | 300 |
| 2020-06-30 | 300 |
| 2020-07-01 | 300 |
| 2020-07-02 | 300 |
| 2020-07-03 | 300 |
| 2020-07-04 | 300 |
| 2020-07-05 | 300 |
| 2020-07-06 | 300 |
| 2020-07-07 | 300 |
| 2020-07-08 | 300 |
| 2020-07-09 | 300 |
| 2020-07-10 | 300 |
| 2020-07-11 | 300 |
| 2020-07-12 | 300 |
| 2020-07-13 | 300 |
| 2020-07-14 | 300 |
| 2020-07-15 | 300 |
| 2020-07-16 | 300 |
| 2020-07-17 | 300 |
| 2020-07-18 | 300 |
| 2020-07-19 | 300 |
| 2020-07-20 | 300 |
| 2020-07-21 | 300 |
| 2020-07-22 | 300 |
| 2020-07-23 | 300 |
| 2020-07-24 | 300 |
| 2020-07-25 | 300 |
| 2020-07-26 | 300 |
| 2020-07-27 | 300 |
| 2020-07-28 | 300 |
| 2020-07-29 | 300 |
| 2020-07-30 | 300 |
| 2020-07-31 | 300 |
| 2020-08-01 | 300 |
| 2020-08-02 | 300 |
| 2020-08-03 | 300 |
| 2020-08-04 | 300 |
| 2020-08-05 | 300 |
| 2020-08-06 | 300 |
| 2020-08-07 | 300 |
| 2020-08-08 | 300 |
| 2020-08-09 | 300 |
| 2020-08-10 | 300 |
| 2020-08-11 | 300 |
| 2020-08-12 | 300 |
| 2020-08-13 | 300 |
| 2020-08-14 | 300 |
| 2020-08-15 | 300 |
| 2020-08-16 | 300 |
| 2020-08-17 | 300 |
| 2020-08-18 | 300 |
| 2020-08-19 | 300 |
| 2020-08-20 | 300 |
| 2020-08-21 | 300 |
| 2020-08-22 | 300 |
| 2020-08-23 | 300 |
| 2020-08-24 | 300 |
| 2020-08-25 | 300 |
| 2020-08-26 | 300 |
| 2020-08-27 | 300 |
| 2020-08-28 | 300 |
| 2020-08-29 | 300 |
| 2020-08-30 | 300 |
| 2020-08-31 | 300 |
| 2020-09-01 | 300 |
| 2020-09-02 | 300 |
| 2020-09-03 | 300 |
| 2020-09-04 | 300 |
| 2020-09-05 | 300 |
| 2020-09-06 | 300 |
| 2020-09-07 | 300 |
| 2020-09-08 | 300 |
| 2020-09-09 | 300 |
| 2020-09-10 | 300 |
| 2020-09-11 | 300 |
| 2020-09-12 | 300 |
| 2020-09-13 | 300 |
| 2020-09-14 | 300 |
| 2020-09-15 | 300 |
| 2020-09-16 | 300 |
| 2020-09-17 | 300 |
| 2020-09-18 | 300 |
| 2020-09-19 | 300 |
| 2020-09-20 | 300 |
| 2020-09-21 | 300 |
| 2020-09-22 | 300 |
| 2020-09-23 | 300 |
| 2020-09-24 | 300 |
| 2020-09-25 | 300 |
| 2020-09-26 | 300 |
| 2020-09-27 | 300 |
| 2020-09-28 | 300 |
| 2020-09-29 | 300 |
| 2020-09-30 | 300 |
| 2020-10-01 | 300 |
| 2020-10-02 | 300 |
| 2020-10-03 | 300 |
| 2020-10-04 | 300 |
| 2020-10-05 | 300 |
| 2020-10-06 | 300 |
| 2020-10-07 | 300 |
| 2020-10-08 | 300 |
| 2020-10-09 | 300 |
| 2020-10-10 | 300 |
| 2020-10-11 | 300 |
| 2020-10-12 | 300 |
| 2020-10-13 | 300 |
| 2020-10-14 | 300 |
| 2020-10-15 | 300 |
| 2020-10-16 | 300 |
| 2020-10-17 | 300 |
| 2020-10-18 | 300 |
| 2020-10-19 | 300 |
| 2020-10-20 | 300 |
| 2020-10-21 | 300 |
| 2020-10-22 | 300 |
| 2020-10-23 | 300 |
| 2020-10-24 | 300 |
| 2020-10-25 | 300 |
| 2020-10-26 | 300 |
| 2020-10-27 | 300 |
| 2020-10-28 | 300 |
| 2020-10-29 | 300 |
| 2020-10-30 | 300 |
| 2020-10-31 | 300 |
| 2020-11-01 | 300 |
| 2020-11-02 | 300 |
| 2020-11-03 | 300 |
| 2020-11-04 | 300 |
| 2020-11-05 | 300 |
| 2020-11-06 | 300 |
| 2020-11-07 | 300 |
| 2020-11-08 | 300 |
| 2020-11-09 | 300 |
| 2020-11-10 | 300 |
| 2020-11-11 | 300 |
| 2020-11-12 | 300 |
| 2020-11-13 | 300 |
| 2020-11-14 | 300 |
| 2020-11-15 | 300 |
| 2020-11-16 | 300 |
| 2020-11-17 | 300 |
| 2020-11-18 | 300 |
| 2020-11-19 | 300 |
| 2020-11-20 | 300 |
| 2020-11-21 | 300 |
| 2020-12-01 | 300 |
| 2020-12-02 | 300 |
| 2020-12-03 | 300 |
| 2020-12-04 | 300 |
| 2020-12-05 | 300 |
| 2020-12-06 | 300 |
| 2020-12-07 | 300 |
| 2020-12-08 | 300 |
| 2020-12-09 | 300 |
| 2020-12-10 | 300 |
| 2020-12-11 | 300 |
| 2020-12-12 | 300 |
| 2020-12-13 | 300 |
| 2020-12-14 | 300 |
| 2020-12-15 | 300 |
| 2020-12-16 | 300 |
| 2020-12-17 | 300 |
| 2020-12-18 | 300 |
| 2020-12-19 | 300 |
| 2020-12-20 | 300 |
| 2020-12-21 | 300 |
| 2020-12-22 | 300 |
| 2020-12-23 | 300 |
| 2020-12-24 | 300 |
| 2020-12-25 | 300 |
| 2020-12-26 | 300 |
| 2020-12-27 | 300 |
| 2020-12-28 | 300 |
| 2020-12-29 | 300 |
| 2020-12-30 | 300 |
| 2020-12-31 | 300 |
| 2021-01-01 | 300 |
| 2021-01-02 | 300 |
| 2021-01-03 | 300 |
| 2021-01-04 | 300 |
| 2021-01-05 | 300 |
| 2021-01-06 | 300 |
| 2021-01-07 | 300 |
| 2021-01-08 | 300 |
| 2021-01-09 | 300 |
| 2021-01-10 | 300 |
| 2021-01-11 | 300 |
| 2021-01-12 | 300 |
| 2021-01-13 | 300 |
| 2021-01-14 | 300 |
| 2021-01-15 | 300 |
| 2021-01-16 | 300 |
| 2021-01-17 | 300 |
| 2021-01-18 | 300 |
| 2021-01-19 | 300 |
| 2021-01-20 | 300 |
| 2021-01-21 | 300 |
| 2021-01-22 | 300 |
| 2021-01-23 | 300 |
| 2021-01-24 | 300 |
| 2021-01-25 | 300 |
| 2021-01-26 | 300 |
| 2021-01-27 | 300 |
| 2021-01-28 | 300 |
| 2021-01-29 | 300 |
| 2021-01-30 | 300 |
| 2021-01-31 | 300 |
| 2021-02-01 | 300 |
| 2021-02-02 | 300 |
| 2021-02-03 | 300 |
| 2021-02-04 | 300 |
| 2021-02-05 | 300 |
| 2021-02-06 | 300 |
| 2021-02-07 | 300 |
| 2021-02-08 | 300 |
| 2021-02-09 | 300 |
| 2021-02-10 | 300 |
| 2021-02-11 | 300 |
| 2021-02-12 | 300 |
| 2021-02-13 | 300 |
| 2021-02-14 | 300 |
| 2021-02-15 | 300 |
| 2021-02-16 | 300 |
| 2021-02-17 | 300 |
| 2021-02-18 | 300 |
| 2021-02-19 | 300 |
| 2021-02-20 | 300 |
| 2021-02-21 | 300 |
| 2021-02-22 | 300 |
| 2021-02-23 | 300 |
| 2021-02-24 | 300 |
| 2021-02-25 | 300 |
| 2021-02-26 | 300 |
| 2021-02-27 | 300 |
| 2021-02-28 | 300 |
| 2021-03-01 | 300 |
| 2021-03-02 | 300 |
| 2021-03-03 | 300 |
| 2021-03-04 | 300 |
| 2021-03-05 | 300 |
| 2021-03-06 | 300 |
| 2021-03-07 | 300 |
| 2021-03-08 | 300 |
| 2021-03-09 | 300 |
| 2021-03-10 | 300 |
| 2021-03-11 | 300 |
| 2021-03-12 | 300 |
| 2021-03-13 | 300 |
| 2021-03-14 | 300 |
| 2021-03-15 | 300 |
| 2021-03-16 | 300 |
| 2021-03-17 | 300 |
| 2021-03-18 | 300 |
| 2021-03-19 | 300 |
| 2021-03-20 | 300 |
| 2021-03-21 | 300 |
| 2021-03-22 | 300 |
| 2021-03-23 | 300 |
| 2021-03-24 | 300 |
| 2021-03-25 | 300 |
| 2021-03-26 | 300 |
| 2021-03-27 | 300 |
| 2021-03-28 | 300 |
| 2021-03-29 | 300 |
| 2021-03-30 | 300 |
| 2021-03-31 | 300 |
| 2021-04-01 | 300 |
| 2021-04-02 | 300 |
| 2021-04-03 | 300 |
| 2021-04-04 | 300 |
| 2021-04-05 | 300 |
| 2021-04-06 | 300 |
| 2021-04-07 | 300 |
| 2021-04-08 | 300 |
| 2021-04-09 | 300 |
| 2021-04-10 | 300 |
| 2021-04-11 | 300 |
| 2021-04-12 | 300 |
| 2021-04-13 | 300 |
| 2021-04-14 | 300 |
| 2021-04-15 | 300 |
| 2021-04-16 | 300 |
| 2021-04-17 | 300 |
| 2021-04-18 | 300 |
| 2021-04-19 | 300 |
| 2021-04-20 | 300 |
| 2021-04-21 | 300 |
| 2021-04-22 | 300 |
| 2021-04-23 | 300 |
| 2021-04-24 | 300 |
| 2021-04-25 | 300 |
| 2021-04-26 | 300 |
| 2021-04-27 | 300 |
| 2021-04-28 | 300 |
| 2021-04-29 | 300 |
| 2021-04-30 | 300 |
| 2021-05-01 | 300 |
| 2021-05-02 | 300 |
| 2021-05-03 | 300 |
| 2021-05-04 | 300 |
| 2021-05-05 | 300 |
| 2021-05-06 | 300 |
| 2021-05-07 | 300 |
| 2021-05-08 | 300 |
| 2021-05-09 | 300 |
| 2021-05-10 | 300 |
| 2021-05-11 | 300 |
| 2021-05-12 | 300 |
| 2021-05-13 | 300 |
| 2021-05-14 | 300 |
| 2021-05-15 | 300 |
| 2021-05-16 | 300 |
| 2021-05-17 | 300 |
| 2021-05-18 | 300 |
| 2021-05-19 | 300 |
| 2021-05-20 | 300 |
| 2021-05-21 | 300 |
| 2021-05-22 | 300 |
| 2021-05-23 | 300 |
| 2021-05-24 | 300 |
| 2021-05-25 | 300 |
| 2021-05-26 | 300 |
| 2021-05-27 | 300 |
| 2021-05-28 | 300 |
| 2021-05-29 | 300 |
| 2021-05-30 | 300 |
| 2021-05-31 | 300 |
| 2021-06-01 | 300 |
| 2021-06-02 | 300 |
| 2021-06-03 | 300 |
| 2021-06-04 | 300 |
| 2021-06-05 | 300 |
| 2021-06-06 | 300 |
| 2021-06-07 | 300 |
| 2021-06-08 | 300 |
| 2021-06-09 | 300 |
| 2021-06-10 | 300 |
| 2021-06-11 | 300 |
| 2021-06-12 | 300 |
| 2021-06-13 | 300 |
| 2021-06-14 | 300 |
| 2021-06-15 | 300 |
| 2021-06-16 | 300 |
| 2021-06-17 | 300 |
| 2021-06-18 | 300 |
| 2021-06-19 | 300 |
| 2021-06-20 | 300 |
| 2021-06-21 | 300 |
| 2021-06-22 | 300 |
| 2021-06-23 | 300 |
| 2021-06-24 | 300 |
| 2021-06-25 | 300 |
| 2021-06-26 | 300 |
| 2021-06-27 | 300 |
| 2021-06-28 | 300 |
| 2021-06-29 | 300 |
| 2021-06-30 | 300 |
| 2021-07-01 | 300 |
| 2021-07-02 | 300 |
| 2021-07-03 | 300 |
| 2021-07-04 | 300 |
| 2021-07-05 | 300 |
| 2021-07-06 | 300 |
| 2021-07-07 | 300 |
| 2021-07-08 | 300 |
| 2021-07-09 | 300 |
| 2021-07-10 | 300 |
| 2021-07-11 | 300 |
| 2021-07-12 | 300 |
| 2021-07-13 | 300 |
| 2021-07-14 | 300 |
| 2021-07-15 | 300 |
| 2021-07-16 | 300 |
| 2021-07-17 | 300 |
| 2021-07-18 | 300 |
| 2021-07-19 | 300 |
| 2021-07-20 | 300 |
| 2021-07-21 | 300 |
| 2021-07-22 | 300 |
| 2021-07-23 | 300 |
| 2021-07-24 | 300 |
| 2021-07-25 | 300 |
| 2021-07-26 | 300 |
| 2021-07-27 | 300 |
| 2021-07-28 | 300 |
| 2021-07-29 | 300 |
| 2021-07-30 | 300 |
| 2021-07-31 | 300 |
| 2021-08-01 | 300 |
| 2021-08-02 | 300 |
| 2021-08-03 | 300 |
| 2021-08-04 | 300 |
| 2021-08-05 | 300 |
| 2021-08-06 | 300 |
| 2021-08-07 | 300 |
| 2021-08-08 | 300 |
| 2021-08-09 | 300 |
| 2021-08-10 | 300 |
| 2021-08-11 | 300 |
| 2021-08-12 | 300 |
| 2021-08-13 | 300 |
| 2021-08-14 | 300 |
| 2021-08-15 | 300 |
| 2021-08-16 | 300 |
| 2021-08-17 | 300 |
| 2021-08-18 | 300 |
| 2021-08-19 | 300 |
| 2021-08-20 | 300 |
| 2021-08-21 | 300 |
| 2021-08-22 | 300 |
| 2021-08-23 | 300 |
| 2021-08-24 | 300 |
| 2021-08-25 | 300 |
| 2021-08-26 | 300 |
| 2021-08-27 | 300 |
| 2021-08-28 | 300 |
| 2021-08-29 | 300 |
| 2021-08-30 | 300 |
| 2021-08-31 | 300 |
| 2021-09-01 | 300 |
| 2021-09-02 | 300 |
| 2021-09-03 | 300 |
| 2021-09-04 | 300 |
| 2021-09-05 | 300 |
| 2021-09-06 | 300 |
| 2021-09-07 | 300 |
| 2021-09-08 | 300 |
| 2021-09-09 | 300 |
| 2021-09-10 | 300 |
| 2021-09-11 | 300 |
| 2021-09-12 | 300 |
| 2021-09-13 | 300 |
| 2021-09-14 | 300 |
| 2021-09-15 | 300 |
| 2021-09-16 | 300 |
| 2021-09-17 | 300 |
| 2021-09-18 | 300 |
| 2021-09-19 | 300 |
| 2021-09-20 | 300 |
| 2021-09-21 | 300 |
| 2021-09-22 | 300 |
| 2021-09-23 | 300 |
| 2021-09-24 | 300 |
| 2021-09-25 | 300 |
| 2021-09-26 | 300 |
| 2021-09-27 | 300 |
| 2021-09-28 | 300 |
| 2021-09-29 | 300 |
| 2021-09-30 | 300 |
| 2021-10-01 | 300 |
| 2021-10-02 | 300 |
| 2021-10-03 | 300 |
| 2021-10-04 | 300 |
| 2021-10-05 | 300 |
| 2021-10-06 | 300 |
| 2021-10-07 | 300 |
| 2021-10-08 | 300 |
| 2021-10-09 | 300 |
| 2021-10-10 | 300 |
| 2021-10-11 | 300 |
| 2021-10-12 | 300 |
| 2021-10-13 | 300 |
| 2021-10-14 | 300 |
| 2021-10-15 | 300 |
| 2021-10-16 | 300 |
| 2021-10-17 | 300 |
| 2021-10-18 | 300 |
| 2021-10-19 | 300 |
| 2021-10-20 | 300 |
| 2021-10-21 | 300 |
| 2021-10-22 | 300 |
| 2021-10-23 | 300 |
| 2021-10-24 | 300 |
| 2021-10-25 | 300 |
| 2021-10-26 | 300 |
| 2021-10-27 | 300 |
| 2021-10-28 | 300 |
| 2021-10-29 | 300 |
| 2021-10-30 | 300 |
| 2021-10-31 | 300 |
| 2021-11-01 | 300 |
| 2021-11-02 | 300 |
| 2021-11-03 | 300 |
| 2021-11-04 | 300 |
| 2021-11-05 | 300 |
| 2021-11-06 | 300 |
| 2021-11-07 | 300 |
| 2021-11-08 | 300 |
| 2021-11-09 | 300 |
| 2021-11-10 | 300 |
| 2021-11-11 | 300 |
| 2021-11-12 | 300 |
| 2021-11-13 | 300 |
| 2021-11-14 | 300 |
| 2021-11-15 | 300 |
| 2021-11-16 | 300 |
| 2021-11-17 | 300 |
| 2021-11-18 | 300 |
| 2021-11-19 | 300 |
| 2021-11-20 | 300 |
| 2021-11-21 | 300 |
| 2021-11-22 | 300 |
| 2021-11-23 | 300 |
| 2021-11-24 | 300 |
| 2021-11-25 | 300 |
| 2021-11-26 | 300 |
| 2021-11-27 | 300 |
| 2021-11-28 | 300 |
| 2021-11-29 | 300 |
| 2021-11-30 | 300 |
| 2021-12-01 | 300 |
| 2021-12-02 | 300 |
| 2021-12-03 | 300 |
| 2021-12-04 | 300 |
| 2021-12-05 | 300 |
| 2021-12-06 | 300 |
| 2021-12-07 | 300 |
| 2021-12-08 | 300 |
| 2021-12-09 | 300 |
| 2021-12-10 | 300 |
| 2021-12-11 | 300 |
| 2021-12-12 | 300 |
| 2021-12-13 | 300 |
| 2021-12-14 | 300 |
| 2021-12-15 | 300 |
| 2021-12-16 | 300 |
| 2021-12-17 | 300 |
| 2021-12-18 | 300 |
| 2021-12-19 | 300 |
| 2021-12-20 | 300 |
| 2021-12-21 | 300 |
| 2021-12-22 | 300 |
| 2021-12-23 | 300 |
| 2021-12-24 | 300 |
| 2021-12-25 | 300 |
| 2021-12-26 | 300 |
| 2021-12-27 | 300 |
| 2021-12-28 | 300 |
| 2021-12-29 | 300 |
| 2021-12-30 | 300 |
| 2021-12-31 | 300 |
| 2022-01-01 | 300 |
| 2022-01-02 | 300 |
| 2022-01-03 | 300 |
| 2022-01-04 | 300 |
| 2022-01-05 | 300 |
| 2022-01-06 | 300 |
| 2022-01-07 | 300 |
| 2022-01-08 | 300 |
| 2022-01-09 | 300 |
| 2022-01-10 | 300 |
| 2022-01-11 | 300 |
| 2022-01-12 | 300 |
| 2022-01-13 | 300 |
| 2022-01-14 | 300 |
| 2022-01-15 | 300 |
| 2022-01-16 | 300 |
| 2022-01-17 | 300 |
| 2022-01-18 | 300 |
| 2022-01-19 | 300 |
| 2022-01-20 | 300 |
| 2022-01-21 | 300 |
| 2022-01-22 | 300 |
| 2022-01-23 | 300 |
| 2022-01-24 | 300 |
| 2022-01-25 | 300 |
| 2022-01-26 | 300 |
| 2022-01-27 | 300 |
| 2022-01-28 | 300 |
| 2022-01-29 | 300 |
| 2022-01-30 | 300 |
| 2022-01-31 | 300 |
| 2022-02-01 | 300 |
| 2022-02-02 | 300 |
| 2022-02-03 | 300 |
| 2022-02-04 | 300 |
| 2022-02-05 | 300 |
| 2022-02-06 | 300 |
| 2022-02-07 | 300 |
| 2022-02-08 | 300 |
| 2022-02-09 | 300 |
| 2022-02-10 | 300 |
| 2022-02-11 | 300 |
| 2022-02-12 | 300 |
| 2022-02-13 | 300 |
| 2022-02-14 | 300 |
| 2022-02-15 | 300 |
| 2022-02-16 | 300 |
| 2022-02-17 | 300 |
| 2022-02-18 | 300 |
| 2022-02-19 | 300 |
| 2022-02-20 | 300 |
| 2022-02-21 | 300 |
| 2022-02-22 | 300 |
| 2022-02-23 | 300 |
| 2022-02-24 | 300 |
| 2022-02-25 | 300 |
| 2022-02-26 | 300 |
| 2022-02-27 | 300 |
| 2022-02-28 | 300 |
| 2022-03-01 | 300 |
| 2022-03-02 | 300 |
| 2022-03-03 | 300 |
| 2022-03-04 | 300 |
| 2022-03-05 | 300 |
| 2022-03-06 | 300 |
| 2022-03-07 | 300 |
| 2022-03-08 | 300 |
| 2022-03-09 | 300 |
| 2022-03-10 | 300 |
| 2022-03-11 | 300 |
| 2022-03-12 | 300 |
| 2022-03-13 | 300 |
| 2022-03-14 | 300 |
| 2022-03-15 | 300 |
| 2022-03-16 | 300 |
| 2022-03-17 | 300 |
| 2022-03-18 | 300 |
| 2022-03-19 | 300 |
| 2022-03-20 | 300 |
| 2022-03-21 | 300 |
| 2022-03-22 | 300 |
| 2022-03-23 | 300 |
| 2022-03-24 | 330 |
| 2022-03-25 | 330 |
| 2022-03-26 | 330 |
| 2022-03-27 | 330 |
| 2022-03-28 | 330 |
| 2022-03-29 | 330 |
| 2022-03-30 | 330 |
| 2022-03-31 | 330 |